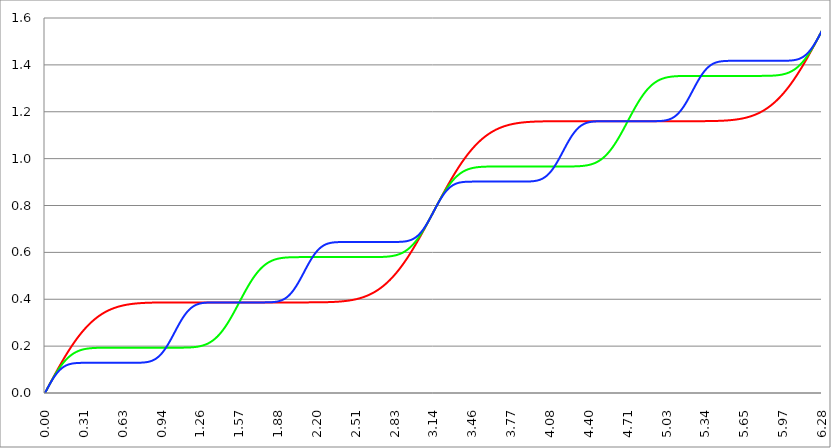
| Category | Series 1 | Series 0 | Series 2 |
|---|---|---|---|
| 0.0 | 0 | 0 | 0 |
| 0.00314159265358979 | 0.003 | 0.003 | 0.003 |
| 0.00628318530717958 | 0.006 | 0.006 | 0.006 |
| 0.00942477796076938 | 0.009 | 0.009 | 0.009 |
| 0.0125663706143592 | 0.013 | 0.013 | 0.013 |
| 0.015707963267949 | 0.016 | 0.016 | 0.016 |
| 0.0188495559215388 | 0.019 | 0.019 | 0.019 |
| 0.0219911485751285 | 0.022 | 0.022 | 0.022 |
| 0.0251327412287183 | 0.025 | 0.025 | 0.025 |
| 0.0282743338823081 | 0.028 | 0.028 | 0.028 |
| 0.0314159265358979 | 0.031 | 0.031 | 0.031 |
| 0.0345575191894877 | 0.034 | 0.034 | 0.034 |
| 0.0376991118430775 | 0.038 | 0.037 | 0.037 |
| 0.0408407044966673 | 0.041 | 0.04 | 0.04 |
| 0.0439822971502571 | 0.044 | 0.043 | 0.043 |
| 0.0471238898038469 | 0.047 | 0.046 | 0.046 |
| 0.0502654824574367 | 0.05 | 0.049 | 0.048 |
| 0.0534070751110265 | 0.053 | 0.052 | 0.051 |
| 0.0565486677646163 | 0.056 | 0.055 | 0.054 |
| 0.059690260418206 | 0.059 | 0.058 | 0.057 |
| 0.0628318530717958 | 0.062 | 0.061 | 0.059 |
| 0.0659734457253856 | 0.065 | 0.064 | 0.062 |
| 0.0691150383789754 | 0.069 | 0.067 | 0.064 |
| 0.0722566310325652 | 0.072 | 0.07 | 0.067 |
| 0.075398223686155 | 0.075 | 0.073 | 0.069 |
| 0.0785398163397448 | 0.078 | 0.075 | 0.072 |
| 0.0816814089933346 | 0.081 | 0.078 | 0.074 |
| 0.0848230016469244 | 0.084 | 0.081 | 0.076 |
| 0.0879645943005142 | 0.087 | 0.084 | 0.079 |
| 0.091106186954104 | 0.09 | 0.086 | 0.081 |
| 0.0942477796076937 | 0.093 | 0.089 | 0.083 |
| 0.0973893722612835 | 0.096 | 0.092 | 0.085 |
| 0.100530964914873 | 0.099 | 0.094 | 0.087 |
| 0.103672557568463 | 0.102 | 0.097 | 0.089 |
| 0.106814150222053 | 0.105 | 0.099 | 0.091 |
| 0.109955742875643 | 0.108 | 0.102 | 0.093 |
| 0.113097335529233 | 0.111 | 0.104 | 0.095 |
| 0.116238928182822 | 0.114 | 0.107 | 0.096 |
| 0.119380520836412 | 0.117 | 0.109 | 0.098 |
| 0.122522113490002 | 0.12 | 0.111 | 0.099 |
| 0.125663706143592 | 0.122 | 0.114 | 0.101 |
| 0.128805298797181 | 0.125 | 0.116 | 0.103 |
| 0.131946891450771 | 0.128 | 0.118 | 0.104 |
| 0.135088484104361 | 0.131 | 0.12 | 0.105 |
| 0.138230076757951 | 0.134 | 0.122 | 0.107 |
| 0.141371669411541 | 0.137 | 0.124 | 0.108 |
| 0.14451326206513 | 0.14 | 0.127 | 0.109 |
| 0.14765485471872 | 0.142 | 0.129 | 0.11 |
| 0.15079644737231 | 0.145 | 0.131 | 0.111 |
| 0.1539380400259 | 0.148 | 0.133 | 0.112 |
| 0.15707963267949 | 0.151 | 0.134 | 0.114 |
| 0.160221225333079 | 0.154 | 0.136 | 0.114 |
| 0.163362817986669 | 0.156 | 0.138 | 0.115 |
| 0.166504410640259 | 0.159 | 0.14 | 0.116 |
| 0.169646003293849 | 0.162 | 0.142 | 0.117 |
| 0.172787595947439 | 0.165 | 0.143 | 0.118 |
| 0.175929188601028 | 0.167 | 0.145 | 0.119 |
| 0.179070781254618 | 0.17 | 0.147 | 0.119 |
| 0.182212373908208 | 0.173 | 0.148 | 0.12 |
| 0.185353966561798 | 0.175 | 0.15 | 0.121 |
| 0.188495559215388 | 0.178 | 0.152 | 0.121 |
| 0.191637151868977 | 0.18 | 0.153 | 0.122 |
| 0.194778744522567 | 0.183 | 0.155 | 0.122 |
| 0.197920337176157 | 0.186 | 0.156 | 0.123 |
| 0.201061929829747 | 0.188 | 0.157 | 0.123 |
| 0.204203522483336 | 0.191 | 0.159 | 0.124 |
| 0.207345115136926 | 0.193 | 0.16 | 0.124 |
| 0.210486707790516 | 0.196 | 0.161 | 0.125 |
| 0.213628300444106 | 0.198 | 0.163 | 0.125 |
| 0.216769893097696 | 0.201 | 0.164 | 0.125 |
| 0.219911485751285 | 0.203 | 0.165 | 0.126 |
| 0.223053078404875 | 0.206 | 0.166 | 0.126 |
| 0.226194671058465 | 0.208 | 0.167 | 0.126 |
| 0.229336263712055 | 0.211 | 0.168 | 0.126 |
| 0.232477856365645 | 0.213 | 0.169 | 0.127 |
| 0.235619449019234 | 0.215 | 0.17 | 0.127 |
| 0.238761041672824 | 0.218 | 0.171 | 0.127 |
| 0.241902634326414 | 0.22 | 0.172 | 0.127 |
| 0.245044226980004 | 0.222 | 0.173 | 0.127 |
| 0.248185819633594 | 0.225 | 0.174 | 0.127 |
| 0.251327412287183 | 0.227 | 0.175 | 0.128 |
| 0.254469004940773 | 0.229 | 0.176 | 0.128 |
| 0.257610597594363 | 0.232 | 0.176 | 0.128 |
| 0.260752190247953 | 0.234 | 0.177 | 0.128 |
| 0.263893782901543 | 0.236 | 0.178 | 0.128 |
| 0.267035375555132 | 0.238 | 0.179 | 0.128 |
| 0.270176968208722 | 0.24 | 0.179 | 0.128 |
| 0.273318560862312 | 0.243 | 0.18 | 0.128 |
| 0.276460153515902 | 0.245 | 0.181 | 0.128 |
| 0.279601746169492 | 0.247 | 0.181 | 0.128 |
| 0.282743338823082 | 0.249 | 0.182 | 0.128 |
| 0.285884931476671 | 0.251 | 0.182 | 0.128 |
| 0.289026524130261 | 0.253 | 0.183 | 0.129 |
| 0.292168116783851 | 0.255 | 0.183 | 0.129 |
| 0.295309709437441 | 0.257 | 0.184 | 0.129 |
| 0.298451302091031 | 0.259 | 0.184 | 0.129 |
| 0.30159289474462 | 0.261 | 0.185 | 0.129 |
| 0.30473448739821 | 0.263 | 0.185 | 0.129 |
| 0.3078760800518 | 0.265 | 0.186 | 0.129 |
| 0.31101767270539 | 0.267 | 0.186 | 0.129 |
| 0.31415926535898 | 0.269 | 0.187 | 0.129 |
| 0.31730085801257 | 0.271 | 0.187 | 0.129 |
| 0.320442450666159 | 0.273 | 0.187 | 0.129 |
| 0.323584043319749 | 0.275 | 0.188 | 0.129 |
| 0.326725635973339 | 0.276 | 0.188 | 0.129 |
| 0.329867228626929 | 0.278 | 0.188 | 0.129 |
| 0.333008821280519 | 0.28 | 0.189 | 0.129 |
| 0.336150413934108 | 0.282 | 0.189 | 0.129 |
| 0.339292006587698 | 0.284 | 0.189 | 0.129 |
| 0.342433599241288 | 0.285 | 0.189 | 0.129 |
| 0.345575191894878 | 0.287 | 0.19 | 0.129 |
| 0.348716784548468 | 0.289 | 0.19 | 0.129 |
| 0.351858377202058 | 0.29 | 0.19 | 0.129 |
| 0.354999969855647 | 0.292 | 0.19 | 0.129 |
| 0.358141562509237 | 0.294 | 0.19 | 0.129 |
| 0.361283155162827 | 0.295 | 0.191 | 0.129 |
| 0.364424747816417 | 0.297 | 0.191 | 0.129 |
| 0.367566340470007 | 0.298 | 0.191 | 0.129 |
| 0.370707933123597 | 0.3 | 0.191 | 0.129 |
| 0.373849525777186 | 0.302 | 0.191 | 0.129 |
| 0.376991118430776 | 0.303 | 0.191 | 0.129 |
| 0.380132711084366 | 0.305 | 0.192 | 0.129 |
| 0.383274303737956 | 0.306 | 0.192 | 0.129 |
| 0.386415896391546 | 0.308 | 0.192 | 0.129 |
| 0.389557489045135 | 0.309 | 0.192 | 0.129 |
| 0.392699081698725 | 0.31 | 0.192 | 0.129 |
| 0.395840674352315 | 0.312 | 0.192 | 0.129 |
| 0.398982267005905 | 0.313 | 0.192 | 0.129 |
| 0.402123859659495 | 0.315 | 0.192 | 0.129 |
| 0.405265452313085 | 0.316 | 0.192 | 0.129 |
| 0.408407044966674 | 0.317 | 0.192 | 0.129 |
| 0.411548637620264 | 0.319 | 0.192 | 0.129 |
| 0.414690230273854 | 0.32 | 0.193 | 0.129 |
| 0.417831822927444 | 0.321 | 0.193 | 0.129 |
| 0.420973415581034 | 0.323 | 0.193 | 0.129 |
| 0.424115008234623 | 0.324 | 0.193 | 0.129 |
| 0.427256600888213 | 0.325 | 0.193 | 0.129 |
| 0.430398193541803 | 0.326 | 0.193 | 0.129 |
| 0.433539786195393 | 0.327 | 0.193 | 0.129 |
| 0.436681378848983 | 0.329 | 0.193 | 0.129 |
| 0.439822971502573 | 0.33 | 0.193 | 0.129 |
| 0.442964564156162 | 0.331 | 0.193 | 0.129 |
| 0.446106156809752 | 0.332 | 0.193 | 0.129 |
| 0.449247749463342 | 0.333 | 0.193 | 0.129 |
| 0.452389342116932 | 0.334 | 0.193 | 0.129 |
| 0.455530934770522 | 0.335 | 0.193 | 0.129 |
| 0.458672527424111 | 0.336 | 0.193 | 0.129 |
| 0.461814120077701 | 0.337 | 0.193 | 0.129 |
| 0.464955712731291 | 0.338 | 0.193 | 0.129 |
| 0.468097305384881 | 0.34 | 0.193 | 0.129 |
| 0.471238898038471 | 0.341 | 0.193 | 0.129 |
| 0.474380490692061 | 0.341 | 0.193 | 0.129 |
| 0.47752208334565 | 0.342 | 0.193 | 0.129 |
| 0.48066367599924 | 0.343 | 0.193 | 0.129 |
| 0.48380526865283 | 0.344 | 0.193 | 0.129 |
| 0.48694686130642 | 0.345 | 0.193 | 0.129 |
| 0.49008845396001 | 0.346 | 0.193 | 0.129 |
| 0.493230046613599 | 0.347 | 0.193 | 0.129 |
| 0.496371639267189 | 0.348 | 0.193 | 0.129 |
| 0.499513231920779 | 0.349 | 0.193 | 0.129 |
| 0.502654824574369 | 0.35 | 0.193 | 0.129 |
| 0.505796417227959 | 0.35 | 0.193 | 0.129 |
| 0.508938009881549 | 0.351 | 0.193 | 0.129 |
| 0.512079602535138 | 0.352 | 0.193 | 0.129 |
| 0.515221195188728 | 0.353 | 0.193 | 0.129 |
| 0.518362787842318 | 0.354 | 0.193 | 0.129 |
| 0.521504380495908 | 0.354 | 0.193 | 0.129 |
| 0.524645973149498 | 0.355 | 0.193 | 0.129 |
| 0.527787565803087 | 0.356 | 0.193 | 0.129 |
| 0.530929158456677 | 0.357 | 0.193 | 0.129 |
| 0.534070751110267 | 0.357 | 0.193 | 0.129 |
| 0.537212343763857 | 0.358 | 0.193 | 0.129 |
| 0.540353936417447 | 0.359 | 0.193 | 0.129 |
| 0.543495529071037 | 0.359 | 0.193 | 0.129 |
| 0.546637121724626 | 0.36 | 0.193 | 0.129 |
| 0.549778714378216 | 0.361 | 0.193 | 0.129 |
| 0.552920307031806 | 0.361 | 0.193 | 0.129 |
| 0.556061899685396 | 0.362 | 0.193 | 0.129 |
| 0.559203492338986 | 0.363 | 0.193 | 0.129 |
| 0.562345084992576 | 0.363 | 0.193 | 0.129 |
| 0.565486677646165 | 0.364 | 0.193 | 0.129 |
| 0.568628270299755 | 0.364 | 0.193 | 0.129 |
| 0.571769862953345 | 0.365 | 0.193 | 0.129 |
| 0.574911455606935 | 0.365 | 0.193 | 0.129 |
| 0.578053048260525 | 0.366 | 0.193 | 0.129 |
| 0.581194640914114 | 0.366 | 0.193 | 0.129 |
| 0.584336233567704 | 0.367 | 0.193 | 0.129 |
| 0.587477826221294 | 0.367 | 0.193 | 0.129 |
| 0.590619418874884 | 0.368 | 0.193 | 0.129 |
| 0.593761011528474 | 0.368 | 0.193 | 0.129 |
| 0.596902604182064 | 0.369 | 0.193 | 0.129 |
| 0.600044196835653 | 0.369 | 0.193 | 0.129 |
| 0.603185789489243 | 0.37 | 0.193 | 0.129 |
| 0.606327382142833 | 0.37 | 0.193 | 0.129 |
| 0.609468974796423 | 0.371 | 0.193 | 0.129 |
| 0.612610567450013 | 0.371 | 0.193 | 0.129 |
| 0.615752160103602 | 0.372 | 0.193 | 0.129 |
| 0.618893752757192 | 0.372 | 0.193 | 0.129 |
| 0.622035345410782 | 0.372 | 0.193 | 0.129 |
| 0.625176938064372 | 0.373 | 0.193 | 0.129 |
| 0.628318530717962 | 0.373 | 0.193 | 0.129 |
| 0.631460123371551 | 0.374 | 0.193 | 0.129 |
| 0.634601716025141 | 0.374 | 0.193 | 0.129 |
| 0.637743308678731 | 0.374 | 0.193 | 0.129 |
| 0.640884901332321 | 0.375 | 0.193 | 0.129 |
| 0.644026493985911 | 0.375 | 0.193 | 0.129 |
| 0.647168086639501 | 0.375 | 0.193 | 0.129 |
| 0.65030967929309 | 0.376 | 0.193 | 0.129 |
| 0.65345127194668 | 0.376 | 0.193 | 0.129 |
| 0.65659286460027 | 0.376 | 0.193 | 0.129 |
| 0.65973445725386 | 0.377 | 0.193 | 0.129 |
| 0.66287604990745 | 0.377 | 0.193 | 0.129 |
| 0.666017642561039 | 0.377 | 0.193 | 0.129 |
| 0.669159235214629 | 0.377 | 0.193 | 0.129 |
| 0.672300827868219 | 0.378 | 0.193 | 0.129 |
| 0.675442420521809 | 0.378 | 0.193 | 0.129 |
| 0.678584013175399 | 0.378 | 0.193 | 0.129 |
| 0.681725605828989 | 0.378 | 0.193 | 0.129 |
| 0.684867198482578 | 0.379 | 0.193 | 0.129 |
| 0.688008791136168 | 0.379 | 0.193 | 0.129 |
| 0.691150383789758 | 0.379 | 0.193 | 0.129 |
| 0.694291976443348 | 0.379 | 0.193 | 0.129 |
| 0.697433569096938 | 0.38 | 0.193 | 0.129 |
| 0.700575161750528 | 0.38 | 0.193 | 0.129 |
| 0.703716754404117 | 0.38 | 0.193 | 0.129 |
| 0.706858347057707 | 0.38 | 0.193 | 0.129 |
| 0.709999939711297 | 0.38 | 0.193 | 0.129 |
| 0.713141532364887 | 0.381 | 0.193 | 0.129 |
| 0.716283125018477 | 0.381 | 0.193 | 0.129 |
| 0.719424717672066 | 0.381 | 0.193 | 0.129 |
| 0.722566310325656 | 0.381 | 0.193 | 0.129 |
| 0.725707902979246 | 0.381 | 0.193 | 0.129 |
| 0.728849495632836 | 0.382 | 0.193 | 0.129 |
| 0.731991088286426 | 0.382 | 0.193 | 0.129 |
| 0.735132680940016 | 0.382 | 0.193 | 0.129 |
| 0.738274273593605 | 0.382 | 0.193 | 0.129 |
| 0.741415866247195 | 0.382 | 0.193 | 0.129 |
| 0.744557458900785 | 0.382 | 0.193 | 0.129 |
| 0.747699051554375 | 0.382 | 0.193 | 0.129 |
| 0.750840644207965 | 0.383 | 0.193 | 0.129 |
| 0.753982236861554 | 0.383 | 0.193 | 0.129 |
| 0.757123829515144 | 0.383 | 0.193 | 0.129 |
| 0.760265422168734 | 0.383 | 0.193 | 0.129 |
| 0.763407014822324 | 0.383 | 0.193 | 0.129 |
| 0.766548607475914 | 0.383 | 0.193 | 0.129 |
| 0.769690200129504 | 0.383 | 0.193 | 0.129 |
| 0.772831792783093 | 0.383 | 0.193 | 0.129 |
| 0.775973385436683 | 0.384 | 0.193 | 0.129 |
| 0.779114978090273 | 0.384 | 0.193 | 0.13 |
| 0.782256570743863 | 0.384 | 0.193 | 0.13 |
| 0.785398163397453 | 0.384 | 0.193 | 0.13 |
| 0.788539756051042 | 0.384 | 0.193 | 0.13 |
| 0.791681348704632 | 0.384 | 0.193 | 0.13 |
| 0.794822941358222 | 0.384 | 0.193 | 0.13 |
| 0.797964534011812 | 0.384 | 0.193 | 0.13 |
| 0.801106126665402 | 0.384 | 0.193 | 0.13 |
| 0.804247719318992 | 0.384 | 0.193 | 0.131 |
| 0.807389311972581 | 0.385 | 0.193 | 0.131 |
| 0.810530904626171 | 0.385 | 0.193 | 0.131 |
| 0.813672497279761 | 0.385 | 0.193 | 0.131 |
| 0.816814089933351 | 0.385 | 0.193 | 0.131 |
| 0.819955682586941 | 0.385 | 0.193 | 0.132 |
| 0.823097275240531 | 0.385 | 0.193 | 0.132 |
| 0.82623886789412 | 0.385 | 0.193 | 0.132 |
| 0.82938046054771 | 0.385 | 0.193 | 0.132 |
| 0.8325220532013 | 0.385 | 0.193 | 0.133 |
| 0.83566364585489 | 0.385 | 0.193 | 0.133 |
| 0.83880523850848 | 0.385 | 0.193 | 0.133 |
| 0.841946831162069 | 0.385 | 0.193 | 0.134 |
| 0.845088423815659 | 0.385 | 0.193 | 0.134 |
| 0.848230016469249 | 0.385 | 0.193 | 0.135 |
| 0.851371609122839 | 0.385 | 0.193 | 0.135 |
| 0.854513201776429 | 0.385 | 0.193 | 0.136 |
| 0.857654794430019 | 0.385 | 0.193 | 0.136 |
| 0.860796387083608 | 0.386 | 0.193 | 0.137 |
| 0.863937979737198 | 0.386 | 0.193 | 0.137 |
| 0.867079572390788 | 0.386 | 0.193 | 0.138 |
| 0.870221165044378 | 0.386 | 0.193 | 0.139 |
| 0.873362757697968 | 0.386 | 0.193 | 0.14 |
| 0.876504350351557 | 0.386 | 0.193 | 0.14 |
| 0.879645943005147 | 0.386 | 0.193 | 0.141 |
| 0.882787535658737 | 0.386 | 0.193 | 0.142 |
| 0.885929128312327 | 0.386 | 0.193 | 0.143 |
| 0.889070720965917 | 0.386 | 0.193 | 0.144 |
| 0.892212313619507 | 0.386 | 0.193 | 0.145 |
| 0.895353906273096 | 0.386 | 0.193 | 0.146 |
| 0.898495498926686 | 0.386 | 0.193 | 0.147 |
| 0.901637091580276 | 0.386 | 0.193 | 0.148 |
| 0.904778684233866 | 0.386 | 0.193 | 0.149 |
| 0.907920276887456 | 0.386 | 0.193 | 0.151 |
| 0.911061869541045 | 0.386 | 0.193 | 0.152 |
| 0.914203462194635 | 0.386 | 0.193 | 0.153 |
| 0.917345054848225 | 0.386 | 0.193 | 0.155 |
| 0.920486647501815 | 0.386 | 0.193 | 0.156 |
| 0.923628240155405 | 0.386 | 0.193 | 0.158 |
| 0.926769832808995 | 0.386 | 0.193 | 0.159 |
| 0.929911425462584 | 0.386 | 0.193 | 0.161 |
| 0.933053018116174 | 0.386 | 0.193 | 0.163 |
| 0.936194610769764 | 0.386 | 0.193 | 0.164 |
| 0.939336203423354 | 0.386 | 0.193 | 0.166 |
| 0.942477796076944 | 0.386 | 0.193 | 0.168 |
| 0.945619388730533 | 0.386 | 0.193 | 0.17 |
| 0.948760981384123 | 0.386 | 0.193 | 0.172 |
| 0.951902574037713 | 0.386 | 0.193 | 0.174 |
| 0.955044166691303 | 0.386 | 0.193 | 0.176 |
| 0.958185759344893 | 0.386 | 0.193 | 0.178 |
| 0.961327351998483 | 0.386 | 0.193 | 0.181 |
| 0.964468944652072 | 0.386 | 0.193 | 0.183 |
| 0.967610537305662 | 0.386 | 0.193 | 0.185 |
| 0.970752129959252 | 0.386 | 0.193 | 0.187 |
| 0.973893722612842 | 0.386 | 0.193 | 0.19 |
| 0.977035315266432 | 0.386 | 0.193 | 0.192 |
| 0.980176907920022 | 0.386 | 0.193 | 0.195 |
| 0.983318500573611 | 0.386 | 0.193 | 0.198 |
| 0.986460093227201 | 0.386 | 0.193 | 0.2 |
| 0.989601685880791 | 0.386 | 0.193 | 0.203 |
| 0.992743278534381 | 0.386 | 0.193 | 0.206 |
| 0.995884871187971 | 0.386 | 0.193 | 0.208 |
| 0.99902646384156 | 0.386 | 0.193 | 0.211 |
| 1.00216805649515 | 0.386 | 0.193 | 0.214 |
| 1.00530964914874 | 0.386 | 0.193 | 0.217 |
| 1.00845124180233 | 0.386 | 0.193 | 0.22 |
| 1.01159283445592 | 0.386 | 0.193 | 0.223 |
| 1.01473442710951 | 0.386 | 0.193 | 0.226 |
| 1.017876019763099 | 0.386 | 0.193 | 0.229 |
| 1.021017612416689 | 0.386 | 0.193 | 0.232 |
| 1.02415920507028 | 0.386 | 0.193 | 0.235 |
| 1.027300797723869 | 0.386 | 0.193 | 0.238 |
| 1.030442390377459 | 0.386 | 0.193 | 0.241 |
| 1.033583983031048 | 0.386 | 0.193 | 0.244 |
| 1.036725575684638 | 0.387 | 0.193 | 0.247 |
| 1.039867168338228 | 0.387 | 0.193 | 0.25 |
| 1.043008760991818 | 0.387 | 0.193 | 0.254 |
| 1.046150353645408 | 0.387 | 0.193 | 0.257 |
| 1.049291946298998 | 0.387 | 0.193 | 0.26 |
| 1.052433538952587 | 0.387 | 0.193 | 0.263 |
| 1.055575131606177 | 0.387 | 0.193 | 0.266 |
| 1.058716724259767 | 0.387 | 0.193 | 0.269 |
| 1.061858316913357 | 0.387 | 0.193 | 0.272 |
| 1.064999909566947 | 0.387 | 0.193 | 0.275 |
| 1.068141502220536 | 0.387 | 0.193 | 0.279 |
| 1.071283094874126 | 0.387 | 0.193 | 0.282 |
| 1.074424687527716 | 0.387 | 0.193 | 0.285 |
| 1.077566280181306 | 0.387 | 0.193 | 0.288 |
| 1.080707872834896 | 0.387 | 0.193 | 0.291 |
| 1.083849465488486 | 0.387 | 0.193 | 0.294 |
| 1.086991058142075 | 0.387 | 0.193 | 0.297 |
| 1.090132650795665 | 0.387 | 0.193 | 0.299 |
| 1.093274243449255 | 0.387 | 0.193 | 0.302 |
| 1.096415836102845 | 0.387 | 0.193 | 0.305 |
| 1.099557428756435 | 0.387 | 0.193 | 0.308 |
| 1.102699021410025 | 0.387 | 0.193 | 0.311 |
| 1.105840614063614 | 0.387 | 0.193 | 0.313 |
| 1.108982206717204 | 0.387 | 0.193 | 0.316 |
| 1.112123799370794 | 0.387 | 0.194 | 0.319 |
| 1.115265392024384 | 0.387 | 0.194 | 0.321 |
| 1.118406984677974 | 0.387 | 0.194 | 0.324 |
| 1.121548577331563 | 0.387 | 0.194 | 0.326 |
| 1.124690169985153 | 0.387 | 0.194 | 0.329 |
| 1.127831762638743 | 0.387 | 0.194 | 0.331 |
| 1.130973355292333 | 0.387 | 0.194 | 0.333 |
| 1.134114947945923 | 0.387 | 0.194 | 0.336 |
| 1.137256540599513 | 0.387 | 0.194 | 0.338 |
| 1.140398133253102 | 0.387 | 0.194 | 0.34 |
| 1.143539725906692 | 0.387 | 0.194 | 0.342 |
| 1.146681318560282 | 0.387 | 0.194 | 0.344 |
| 1.149822911213872 | 0.387 | 0.194 | 0.346 |
| 1.152964503867462 | 0.387 | 0.194 | 0.348 |
| 1.156106096521051 | 0.387 | 0.194 | 0.35 |
| 1.159247689174641 | 0.387 | 0.194 | 0.352 |
| 1.162389281828231 | 0.387 | 0.194 | 0.353 |
| 1.165530874481821 | 0.387 | 0.194 | 0.355 |
| 1.168672467135411 | 0.387 | 0.194 | 0.357 |
| 1.171814059789001 | 0.387 | 0.194 | 0.358 |
| 1.17495565244259 | 0.387 | 0.195 | 0.36 |
| 1.17809724509618 | 0.387 | 0.195 | 0.361 |
| 1.18123883774977 | 0.387 | 0.195 | 0.363 |
| 1.18438043040336 | 0.387 | 0.195 | 0.364 |
| 1.18752202305695 | 0.387 | 0.195 | 0.365 |
| 1.190663615710539 | 0.387 | 0.195 | 0.366 |
| 1.193805208364129 | 0.387 | 0.195 | 0.368 |
| 1.19694680101772 | 0.387 | 0.195 | 0.369 |
| 1.200088393671309 | 0.387 | 0.195 | 0.37 |
| 1.203229986324899 | 0.387 | 0.196 | 0.371 |
| 1.206371578978489 | 0.387 | 0.196 | 0.372 |
| 1.209513171632078 | 0.387 | 0.196 | 0.373 |
| 1.212654764285668 | 0.387 | 0.196 | 0.374 |
| 1.215796356939258 | 0.387 | 0.196 | 0.375 |
| 1.218937949592848 | 0.387 | 0.197 | 0.375 |
| 1.222079542246438 | 0.387 | 0.197 | 0.376 |
| 1.225221134900027 | 0.387 | 0.197 | 0.377 |
| 1.228362727553617 | 0.387 | 0.197 | 0.378 |
| 1.231504320207207 | 0.387 | 0.197 | 0.378 |
| 1.234645912860797 | 0.387 | 0.198 | 0.379 |
| 1.237787505514387 | 0.387 | 0.198 | 0.379 |
| 1.240929098167977 | 0.387 | 0.198 | 0.38 |
| 1.244070690821566 | 0.387 | 0.199 | 0.38 |
| 1.247212283475156 | 0.387 | 0.199 | 0.381 |
| 1.250353876128746 | 0.387 | 0.199 | 0.381 |
| 1.253495468782336 | 0.387 | 0.2 | 0.382 |
| 1.256637061435926 | 0.387 | 0.2 | 0.382 |
| 1.259778654089515 | 0.387 | 0.2 | 0.382 |
| 1.262920246743105 | 0.387 | 0.201 | 0.383 |
| 1.266061839396695 | 0.387 | 0.201 | 0.383 |
| 1.269203432050285 | 0.387 | 0.202 | 0.383 |
| 1.272345024703875 | 0.387 | 0.202 | 0.384 |
| 1.275486617357465 | 0.387 | 0.203 | 0.384 |
| 1.278628210011054 | 0.387 | 0.203 | 0.384 |
| 1.281769802664644 | 0.387 | 0.204 | 0.384 |
| 1.284911395318234 | 0.387 | 0.204 | 0.385 |
| 1.288052987971824 | 0.387 | 0.205 | 0.385 |
| 1.291194580625414 | 0.387 | 0.205 | 0.385 |
| 1.294336173279003 | 0.387 | 0.206 | 0.385 |
| 1.297477765932593 | 0.387 | 0.207 | 0.385 |
| 1.300619358586183 | 0.387 | 0.207 | 0.385 |
| 1.303760951239773 | 0.387 | 0.208 | 0.386 |
| 1.306902543893363 | 0.387 | 0.209 | 0.386 |
| 1.310044136546953 | 0.387 | 0.209 | 0.386 |
| 1.313185729200542 | 0.387 | 0.21 | 0.386 |
| 1.316327321854132 | 0.387 | 0.211 | 0.386 |
| 1.319468914507722 | 0.387 | 0.212 | 0.386 |
| 1.322610507161312 | 0.387 | 0.213 | 0.386 |
| 1.325752099814902 | 0.387 | 0.213 | 0.386 |
| 1.328893692468491 | 0.387 | 0.214 | 0.386 |
| 1.332035285122081 | 0.387 | 0.215 | 0.386 |
| 1.335176877775671 | 0.387 | 0.216 | 0.386 |
| 1.338318470429261 | 0.387 | 0.217 | 0.386 |
| 1.341460063082851 | 0.387 | 0.218 | 0.386 |
| 1.344601655736441 | 0.387 | 0.219 | 0.386 |
| 1.34774324839003 | 0.387 | 0.221 | 0.386 |
| 1.35088484104362 | 0.387 | 0.222 | 0.386 |
| 1.35402643369721 | 0.387 | 0.223 | 0.386 |
| 1.3571680263508 | 0.387 | 0.224 | 0.386 |
| 1.36030961900439 | 0.387 | 0.225 | 0.386 |
| 1.363451211657979 | 0.387 | 0.227 | 0.386 |
| 1.36659280431157 | 0.387 | 0.228 | 0.386 |
| 1.369734396965159 | 0.387 | 0.229 | 0.386 |
| 1.372875989618749 | 0.387 | 0.231 | 0.387 |
| 1.376017582272339 | 0.387 | 0.232 | 0.387 |
| 1.379159174925929 | 0.387 | 0.234 | 0.387 |
| 1.382300767579518 | 0.387 | 0.235 | 0.387 |
| 1.385442360233108 | 0.387 | 0.237 | 0.387 |
| 1.388583952886698 | 0.387 | 0.238 | 0.387 |
| 1.391725545540288 | 0.387 | 0.24 | 0.387 |
| 1.394867138193878 | 0.387 | 0.241 | 0.387 |
| 1.398008730847468 | 0.387 | 0.243 | 0.387 |
| 1.401150323501057 | 0.387 | 0.245 | 0.387 |
| 1.404291916154647 | 0.387 | 0.247 | 0.387 |
| 1.407433508808237 | 0.387 | 0.248 | 0.387 |
| 1.410575101461827 | 0.387 | 0.25 | 0.387 |
| 1.413716694115417 | 0.387 | 0.252 | 0.387 |
| 1.416858286769006 | 0.387 | 0.254 | 0.387 |
| 1.419999879422596 | 0.387 | 0.256 | 0.387 |
| 1.423141472076186 | 0.387 | 0.258 | 0.387 |
| 1.426283064729776 | 0.387 | 0.26 | 0.387 |
| 1.429424657383366 | 0.387 | 0.262 | 0.387 |
| 1.432566250036956 | 0.387 | 0.264 | 0.387 |
| 1.435707842690545 | 0.387 | 0.266 | 0.387 |
| 1.438849435344135 | 0.387 | 0.269 | 0.387 |
| 1.441991027997725 | 0.387 | 0.271 | 0.387 |
| 1.445132620651315 | 0.387 | 0.273 | 0.387 |
| 1.448274213304905 | 0.387 | 0.275 | 0.387 |
| 1.451415805958494 | 0.387 | 0.278 | 0.387 |
| 1.454557398612084 | 0.387 | 0.28 | 0.387 |
| 1.457698991265674 | 0.387 | 0.282 | 0.387 |
| 1.460840583919264 | 0.387 | 0.285 | 0.387 |
| 1.463982176572854 | 0.387 | 0.287 | 0.387 |
| 1.467123769226444 | 0.387 | 0.29 | 0.387 |
| 1.470265361880033 | 0.387 | 0.292 | 0.387 |
| 1.473406954533623 | 0.387 | 0.295 | 0.387 |
| 1.476548547187213 | 0.387 | 0.298 | 0.387 |
| 1.479690139840803 | 0.387 | 0.3 | 0.387 |
| 1.482831732494393 | 0.387 | 0.303 | 0.387 |
| 1.485973325147982 | 0.387 | 0.306 | 0.387 |
| 1.489114917801572 | 0.387 | 0.308 | 0.387 |
| 1.492256510455162 | 0.387 | 0.311 | 0.387 |
| 1.495398103108752 | 0.387 | 0.314 | 0.387 |
| 1.498539695762342 | 0.387 | 0.317 | 0.387 |
| 1.501681288415932 | 0.387 | 0.32 | 0.387 |
| 1.504822881069521 | 0.387 | 0.322 | 0.387 |
| 1.507964473723111 | 0.387 | 0.325 | 0.387 |
| 1.511106066376701 | 0.387 | 0.328 | 0.387 |
| 1.514247659030291 | 0.387 | 0.331 | 0.387 |
| 1.517389251683881 | 0.387 | 0.334 | 0.387 |
| 1.520530844337471 | 0.387 | 0.337 | 0.387 |
| 1.52367243699106 | 0.387 | 0.34 | 0.387 |
| 1.52681402964465 | 0.387 | 0.343 | 0.387 |
| 1.52995562229824 | 0.387 | 0.346 | 0.387 |
| 1.53309721495183 | 0.387 | 0.349 | 0.387 |
| 1.53623880760542 | 0.387 | 0.352 | 0.387 |
| 1.539380400259009 | 0.387 | 0.355 | 0.387 |
| 1.542521992912599 | 0.387 | 0.358 | 0.387 |
| 1.545663585566189 | 0.387 | 0.362 | 0.387 |
| 1.548805178219779 | 0.387 | 0.365 | 0.387 |
| 1.551946770873369 | 0.387 | 0.368 | 0.387 |
| 1.555088363526959 | 0.387 | 0.371 | 0.387 |
| 1.558229956180548 | 0.387 | 0.374 | 0.387 |
| 1.561371548834138 | 0.387 | 0.377 | 0.387 |
| 1.564513141487728 | 0.387 | 0.38 | 0.387 |
| 1.567654734141318 | 0.387 | 0.383 | 0.387 |
| 1.570796326794908 | 0.387 | 0.387 | 0.387 |
| 1.573937919448497 | 0.387 | 0.39 | 0.387 |
| 1.577079512102087 | 0.387 | 0.393 | 0.387 |
| 1.580221104755677 | 0.387 | 0.396 | 0.387 |
| 1.583362697409267 | 0.387 | 0.399 | 0.387 |
| 1.586504290062857 | 0.387 | 0.402 | 0.387 |
| 1.589645882716447 | 0.387 | 0.405 | 0.387 |
| 1.592787475370036 | 0.387 | 0.408 | 0.387 |
| 1.595929068023626 | 0.387 | 0.412 | 0.387 |
| 1.599070660677216 | 0.387 | 0.415 | 0.387 |
| 1.602212253330806 | 0.387 | 0.418 | 0.387 |
| 1.605353845984396 | 0.387 | 0.421 | 0.387 |
| 1.608495438637985 | 0.387 | 0.424 | 0.387 |
| 1.611637031291575 | 0.387 | 0.427 | 0.387 |
| 1.614778623945165 | 0.387 | 0.43 | 0.387 |
| 1.617920216598755 | 0.387 | 0.433 | 0.387 |
| 1.621061809252345 | 0.387 | 0.436 | 0.387 |
| 1.624203401905935 | 0.387 | 0.439 | 0.387 |
| 1.627344994559524 | 0.387 | 0.442 | 0.387 |
| 1.630486587213114 | 0.387 | 0.445 | 0.387 |
| 1.633628179866704 | 0.387 | 0.448 | 0.387 |
| 1.636769772520294 | 0.387 | 0.451 | 0.387 |
| 1.639911365173884 | 0.387 | 0.454 | 0.387 |
| 1.643052957827473 | 0.387 | 0.456 | 0.387 |
| 1.646194550481063 | 0.387 | 0.459 | 0.387 |
| 1.649336143134653 | 0.387 | 0.462 | 0.387 |
| 1.652477735788243 | 0.387 | 0.465 | 0.387 |
| 1.655619328441833 | 0.387 | 0.467 | 0.387 |
| 1.658760921095423 | 0.387 | 0.47 | 0.387 |
| 1.661902513749012 | 0.387 | 0.473 | 0.387 |
| 1.665044106402602 | 0.387 | 0.475 | 0.387 |
| 1.668185699056192 | 0.387 | 0.478 | 0.387 |
| 1.671327291709782 | 0.387 | 0.481 | 0.387 |
| 1.674468884363372 | 0.387 | 0.483 | 0.387 |
| 1.677610477016961 | 0.387 | 0.486 | 0.387 |
| 1.680752069670551 | 0.387 | 0.488 | 0.387 |
| 1.683893662324141 | 0.387 | 0.491 | 0.387 |
| 1.687035254977731 | 0.387 | 0.493 | 0.387 |
| 1.690176847631321 | 0.387 | 0.495 | 0.387 |
| 1.693318440284911 | 0.387 | 0.498 | 0.387 |
| 1.6964600329385 | 0.387 | 0.5 | 0.387 |
| 1.69960162559209 | 0.387 | 0.502 | 0.387 |
| 1.70274321824568 | 0.387 | 0.505 | 0.387 |
| 1.70588481089927 | 0.387 | 0.507 | 0.387 |
| 1.70902640355286 | 0.387 | 0.509 | 0.387 |
| 1.712167996206449 | 0.387 | 0.511 | 0.387 |
| 1.715309588860039 | 0.387 | 0.513 | 0.387 |
| 1.71845118151363 | 0.387 | 0.515 | 0.387 |
| 1.721592774167219 | 0.387 | 0.517 | 0.387 |
| 1.724734366820809 | 0.387 | 0.519 | 0.387 |
| 1.727875959474399 | 0.387 | 0.521 | 0.387 |
| 1.731017552127988 | 0.387 | 0.523 | 0.387 |
| 1.734159144781578 | 0.387 | 0.525 | 0.387 |
| 1.737300737435168 | 0.387 | 0.527 | 0.387 |
| 1.740442330088758 | 0.387 | 0.528 | 0.387 |
| 1.743583922742348 | 0.387 | 0.53 | 0.387 |
| 1.746725515395937 | 0.387 | 0.532 | 0.387 |
| 1.749867108049527 | 0.387 | 0.533 | 0.387 |
| 1.753008700703117 | 0.387 | 0.535 | 0.387 |
| 1.756150293356707 | 0.387 | 0.537 | 0.387 |
| 1.759291886010297 | 0.387 | 0.538 | 0.387 |
| 1.762433478663887 | 0.387 | 0.54 | 0.387 |
| 1.765575071317476 | 0.387 | 0.541 | 0.387 |
| 1.768716663971066 | 0.387 | 0.543 | 0.387 |
| 1.771858256624656 | 0.387 | 0.544 | 0.387 |
| 1.774999849278246 | 0.387 | 0.545 | 0.387 |
| 1.778141441931836 | 0.387 | 0.547 | 0.387 |
| 1.781283034585426 | 0.387 | 0.548 | 0.387 |
| 1.784424627239015 | 0.387 | 0.549 | 0.387 |
| 1.787566219892605 | 0.387 | 0.55 | 0.387 |
| 1.790707812546195 | 0.387 | 0.551 | 0.387 |
| 1.793849405199785 | 0.387 | 0.553 | 0.387 |
| 1.796990997853375 | 0.387 | 0.554 | 0.387 |
| 1.800132590506964 | 0.387 | 0.555 | 0.387 |
| 1.803274183160554 | 0.387 | 0.556 | 0.387 |
| 1.806415775814144 | 0.387 | 0.557 | 0.387 |
| 1.809557368467734 | 0.387 | 0.558 | 0.387 |
| 1.812698961121324 | 0.387 | 0.559 | 0.387 |
| 1.815840553774914 | 0.387 | 0.56 | 0.387 |
| 1.818982146428503 | 0.387 | 0.561 | 0.387 |
| 1.822123739082093 | 0.387 | 0.561 | 0.387 |
| 1.825265331735683 | 0.387 | 0.562 | 0.387 |
| 1.828406924389273 | 0.387 | 0.563 | 0.387 |
| 1.831548517042863 | 0.387 | 0.564 | 0.387 |
| 1.834690109696452 | 0.387 | 0.565 | 0.388 |
| 1.837831702350042 | 0.387 | 0.565 | 0.388 |
| 1.840973295003632 | 0.387 | 0.566 | 0.388 |
| 1.844114887657222 | 0.387 | 0.567 | 0.388 |
| 1.847256480310812 | 0.387 | 0.567 | 0.388 |
| 1.850398072964402 | 0.387 | 0.568 | 0.388 |
| 1.853539665617991 | 0.387 | 0.568 | 0.388 |
| 1.856681258271581 | 0.387 | 0.569 | 0.389 |
| 1.859822850925171 | 0.387 | 0.57 | 0.389 |
| 1.862964443578761 | 0.387 | 0.57 | 0.389 |
| 1.866106036232351 | 0.387 | 0.571 | 0.389 |
| 1.86924762888594 | 0.387 | 0.571 | 0.389 |
| 1.87238922153953 | 0.387 | 0.571 | 0.39 |
| 1.87553081419312 | 0.387 | 0.572 | 0.39 |
| 1.87867240684671 | 0.387 | 0.572 | 0.39 |
| 1.8818139995003 | 0.387 | 0.573 | 0.391 |
| 1.88495559215389 | 0.387 | 0.573 | 0.391 |
| 1.888097184807479 | 0.387 | 0.574 | 0.391 |
| 1.891238777461069 | 0.387 | 0.574 | 0.392 |
| 1.89438037011466 | 0.387 | 0.574 | 0.392 |
| 1.897521962768249 | 0.387 | 0.575 | 0.393 |
| 1.900663555421839 | 0.387 | 0.575 | 0.393 |
| 1.903805148075429 | 0.387 | 0.575 | 0.394 |
| 1.906946740729018 | 0.387 | 0.575 | 0.394 |
| 1.910088333382608 | 0.387 | 0.576 | 0.395 |
| 1.913229926036198 | 0.387 | 0.576 | 0.396 |
| 1.916371518689788 | 0.387 | 0.576 | 0.396 |
| 1.919513111343378 | 0.387 | 0.576 | 0.397 |
| 1.922654703996967 | 0.387 | 0.577 | 0.398 |
| 1.925796296650557 | 0.387 | 0.577 | 0.399 |
| 1.928937889304147 | 0.387 | 0.577 | 0.399 |
| 1.932079481957737 | 0.387 | 0.577 | 0.4 |
| 1.935221074611327 | 0.387 | 0.577 | 0.401 |
| 1.938362667264917 | 0.387 | 0.578 | 0.402 |
| 1.941504259918506 | 0.387 | 0.578 | 0.403 |
| 1.944645852572096 | 0.387 | 0.578 | 0.404 |
| 1.947787445225686 | 0.387 | 0.578 | 0.405 |
| 1.950929037879276 | 0.387 | 0.578 | 0.407 |
| 1.954070630532866 | 0.387 | 0.578 | 0.408 |
| 1.957212223186455 | 0.387 | 0.578 | 0.409 |
| 1.960353815840045 | 0.387 | 0.578 | 0.411 |
| 1.963495408493635 | 0.387 | 0.579 | 0.412 |
| 1.966637001147225 | 0.387 | 0.579 | 0.413 |
| 1.969778593800815 | 0.387 | 0.579 | 0.415 |
| 1.972920186454405 | 0.387 | 0.579 | 0.416 |
| 1.976061779107994 | 0.387 | 0.579 | 0.418 |
| 1.979203371761584 | 0.387 | 0.579 | 0.42 |
| 1.982344964415174 | 0.387 | 0.579 | 0.421 |
| 1.985486557068764 | 0.387 | 0.579 | 0.423 |
| 1.988628149722354 | 0.387 | 0.579 | 0.425 |
| 1.991769742375943 | 0.387 | 0.579 | 0.427 |
| 1.994911335029533 | 0.387 | 0.579 | 0.429 |
| 1.998052927683123 | 0.387 | 0.579 | 0.431 |
| 2.001194520336712 | 0.387 | 0.579 | 0.433 |
| 2.004336112990302 | 0.387 | 0.579 | 0.435 |
| 2.007477705643892 | 0.387 | 0.579 | 0.437 |
| 2.010619298297482 | 0.387 | 0.579 | 0.44 |
| 2.013760890951071 | 0.387 | 0.579 | 0.442 |
| 2.016902483604661 | 0.387 | 0.58 | 0.444 |
| 2.02004407625825 | 0.387 | 0.58 | 0.447 |
| 2.02318566891184 | 0.387 | 0.58 | 0.449 |
| 2.02632726156543 | 0.387 | 0.58 | 0.452 |
| 2.029468854219019 | 0.387 | 0.58 | 0.454 |
| 2.032610446872609 | 0.387 | 0.58 | 0.457 |
| 2.035752039526198 | 0.387 | 0.58 | 0.46 |
| 2.038893632179788 | 0.387 | 0.58 | 0.462 |
| 2.042035224833378 | 0.387 | 0.58 | 0.465 |
| 2.045176817486967 | 0.387 | 0.58 | 0.468 |
| 2.048318410140557 | 0.387 | 0.58 | 0.471 |
| 2.051460002794146 | 0.387 | 0.58 | 0.474 |
| 2.054601595447736 | 0.387 | 0.58 | 0.477 |
| 2.057743188101325 | 0.387 | 0.58 | 0.479 |
| 2.060884780754915 | 0.387 | 0.58 | 0.482 |
| 2.064026373408505 | 0.387 | 0.58 | 0.485 |
| 2.067167966062094 | 0.387 | 0.58 | 0.488 |
| 2.070309558715684 | 0.387 | 0.58 | 0.492 |
| 2.073451151369273 | 0.387 | 0.58 | 0.495 |
| 2.076592744022863 | 0.387 | 0.58 | 0.498 |
| 2.079734336676452 | 0.387 | 0.58 | 0.501 |
| 2.082875929330042 | 0.387 | 0.58 | 0.504 |
| 2.086017521983632 | 0.387 | 0.58 | 0.507 |
| 2.089159114637221 | 0.387 | 0.58 | 0.51 |
| 2.092300707290811 | 0.387 | 0.58 | 0.513 |
| 2.095442299944401 | 0.387 | 0.58 | 0.516 |
| 2.09858389259799 | 0.387 | 0.58 | 0.52 |
| 2.10172548525158 | 0.387 | 0.58 | 0.523 |
| 2.104867077905169 | 0.387 | 0.58 | 0.526 |
| 2.108008670558759 | 0.387 | 0.58 | 0.529 |
| 2.111150263212349 | 0.387 | 0.58 | 0.532 |
| 2.114291855865938 | 0.387 | 0.58 | 0.535 |
| 2.117433448519528 | 0.387 | 0.58 | 0.538 |
| 2.120575041173117 | 0.387 | 0.58 | 0.541 |
| 2.123716633826707 | 0.387 | 0.58 | 0.544 |
| 2.126858226480297 | 0.387 | 0.58 | 0.547 |
| 2.129999819133886 | 0.387 | 0.58 | 0.55 |
| 2.133141411787476 | 0.387 | 0.58 | 0.553 |
| 2.136283004441065 | 0.387 | 0.58 | 0.556 |
| 2.139424597094655 | 0.387 | 0.58 | 0.559 |
| 2.142566189748245 | 0.387 | 0.58 | 0.562 |
| 2.145707782401834 | 0.387 | 0.58 | 0.565 |
| 2.148849375055424 | 0.387 | 0.58 | 0.568 |
| 2.151990967709013 | 0.387 | 0.58 | 0.57 |
| 2.155132560362603 | 0.387 | 0.58 | 0.573 |
| 2.158274153016193 | 0.387 | 0.58 | 0.576 |
| 2.161415745669782 | 0.387 | 0.58 | 0.578 |
| 2.164557338323372 | 0.387 | 0.58 | 0.581 |
| 2.167698930976961 | 0.387 | 0.58 | 0.583 |
| 2.170840523630551 | 0.387 | 0.58 | 0.586 |
| 2.173982116284141 | 0.387 | 0.58 | 0.588 |
| 2.17712370893773 | 0.387 | 0.58 | 0.59 |
| 2.18026530159132 | 0.387 | 0.58 | 0.593 |
| 2.183406894244909 | 0.387 | 0.58 | 0.595 |
| 2.186548486898499 | 0.387 | 0.58 | 0.597 |
| 2.189690079552089 | 0.387 | 0.58 | 0.599 |
| 2.192831672205678 | 0.387 | 0.58 | 0.601 |
| 2.195973264859268 | 0.387 | 0.58 | 0.603 |
| 2.199114857512857 | 0.387 | 0.58 | 0.605 |
| 2.202256450166447 | 0.387 | 0.58 | 0.607 |
| 2.205398042820036 | 0.387 | 0.58 | 0.609 |
| 2.208539635473626 | 0.387 | 0.58 | 0.611 |
| 2.211681228127216 | 0.387 | 0.58 | 0.612 |
| 2.214822820780805 | 0.387 | 0.58 | 0.614 |
| 2.217964413434395 | 0.387 | 0.58 | 0.615 |
| 2.221106006087984 | 0.387 | 0.58 | 0.617 |
| 2.224247598741574 | 0.387 | 0.58 | 0.618 |
| 2.227389191395164 | 0.387 | 0.58 | 0.62 |
| 2.230530784048753 | 0.387 | 0.58 | 0.621 |
| 2.233672376702343 | 0.387 | 0.58 | 0.623 |
| 2.236813969355933 | 0.387 | 0.58 | 0.624 |
| 2.239955562009522 | 0.387 | 0.58 | 0.625 |
| 2.243097154663112 | 0.387 | 0.58 | 0.626 |
| 2.246238747316701 | 0.387 | 0.58 | 0.627 |
| 2.249380339970291 | 0.387 | 0.58 | 0.628 |
| 2.252521932623881 | 0.387 | 0.58 | 0.629 |
| 2.25566352527747 | 0.387 | 0.58 | 0.63 |
| 2.25880511793106 | 0.387 | 0.58 | 0.631 |
| 2.261946710584649 | 0.387 | 0.58 | 0.632 |
| 2.265088303238239 | 0.387 | 0.58 | 0.633 |
| 2.268229895891829 | 0.387 | 0.58 | 0.634 |
| 2.271371488545418 | 0.387 | 0.58 | 0.634 |
| 2.274513081199008 | 0.388 | 0.58 | 0.635 |
| 2.277654673852597 | 0.388 | 0.58 | 0.636 |
| 2.280796266506186 | 0.388 | 0.58 | 0.636 |
| 2.283937859159776 | 0.388 | 0.58 | 0.637 |
| 2.287079451813366 | 0.388 | 0.58 | 0.637 |
| 2.290221044466955 | 0.388 | 0.58 | 0.638 |
| 2.293362637120545 | 0.388 | 0.58 | 0.638 |
| 2.296504229774135 | 0.388 | 0.58 | 0.639 |
| 2.299645822427724 | 0.388 | 0.58 | 0.639 |
| 2.302787415081314 | 0.388 | 0.58 | 0.64 |
| 2.305929007734904 | 0.388 | 0.58 | 0.64 |
| 2.309070600388493 | 0.388 | 0.58 | 0.64 |
| 2.312212193042083 | 0.388 | 0.58 | 0.641 |
| 2.315353785695672 | 0.388 | 0.58 | 0.641 |
| 2.318495378349262 | 0.388 | 0.58 | 0.641 |
| 2.321636971002852 | 0.388 | 0.58 | 0.642 |
| 2.324778563656441 | 0.388 | 0.58 | 0.642 |
| 2.327920156310031 | 0.388 | 0.58 | 0.642 |
| 2.33106174896362 | 0.389 | 0.58 | 0.642 |
| 2.33420334161721 | 0.389 | 0.58 | 0.642 |
| 2.3373449342708 | 0.389 | 0.58 | 0.643 |
| 2.340486526924389 | 0.389 | 0.58 | 0.643 |
| 2.343628119577979 | 0.389 | 0.58 | 0.643 |
| 2.346769712231568 | 0.389 | 0.58 | 0.643 |
| 2.349911304885158 | 0.389 | 0.58 | 0.643 |
| 2.353052897538748 | 0.389 | 0.58 | 0.643 |
| 2.356194490192337 | 0.389 | 0.58 | 0.643 |
| 2.359336082845927 | 0.389 | 0.58 | 0.643 |
| 2.362477675499516 | 0.389 | 0.58 | 0.644 |
| 2.365619268153106 | 0.39 | 0.58 | 0.644 |
| 2.368760860806696 | 0.39 | 0.58 | 0.644 |
| 2.371902453460285 | 0.39 | 0.58 | 0.644 |
| 2.375044046113875 | 0.39 | 0.58 | 0.644 |
| 2.378185638767464 | 0.39 | 0.58 | 0.644 |
| 2.381327231421054 | 0.39 | 0.58 | 0.644 |
| 2.384468824074644 | 0.39 | 0.58 | 0.644 |
| 2.387610416728233 | 0.39 | 0.58 | 0.644 |
| 2.390752009381823 | 0.391 | 0.58 | 0.644 |
| 2.393893602035412 | 0.391 | 0.58 | 0.644 |
| 2.397035194689002 | 0.391 | 0.58 | 0.644 |
| 2.400176787342591 | 0.391 | 0.58 | 0.644 |
| 2.403318379996181 | 0.391 | 0.58 | 0.644 |
| 2.406459972649771 | 0.391 | 0.58 | 0.644 |
| 2.40960156530336 | 0.391 | 0.58 | 0.644 |
| 2.41274315795695 | 0.392 | 0.58 | 0.644 |
| 2.41588475061054 | 0.392 | 0.58 | 0.644 |
| 2.419026343264129 | 0.392 | 0.58 | 0.644 |
| 2.422167935917719 | 0.392 | 0.58 | 0.644 |
| 2.425309528571308 | 0.392 | 0.58 | 0.644 |
| 2.428451121224898 | 0.392 | 0.58 | 0.644 |
| 2.431592713878488 | 0.393 | 0.58 | 0.644 |
| 2.434734306532077 | 0.393 | 0.58 | 0.644 |
| 2.437875899185667 | 0.393 | 0.58 | 0.644 |
| 2.441017491839256 | 0.393 | 0.58 | 0.644 |
| 2.444159084492846 | 0.393 | 0.58 | 0.644 |
| 2.447300677146435 | 0.394 | 0.58 | 0.644 |
| 2.450442269800025 | 0.394 | 0.58 | 0.644 |
| 2.453583862453615 | 0.394 | 0.58 | 0.644 |
| 2.456725455107204 | 0.394 | 0.58 | 0.644 |
| 2.459867047760794 | 0.395 | 0.58 | 0.644 |
| 2.463008640414384 | 0.395 | 0.58 | 0.644 |
| 2.466150233067973 | 0.395 | 0.58 | 0.644 |
| 2.469291825721563 | 0.395 | 0.58 | 0.644 |
| 2.472433418375152 | 0.396 | 0.58 | 0.644 |
| 2.475575011028742 | 0.396 | 0.58 | 0.644 |
| 2.478716603682332 | 0.396 | 0.58 | 0.644 |
| 2.481858196335921 | 0.397 | 0.58 | 0.644 |
| 2.48499978898951 | 0.397 | 0.58 | 0.644 |
| 2.4881413816431 | 0.397 | 0.58 | 0.644 |
| 2.49128297429669 | 0.398 | 0.58 | 0.644 |
| 2.49442456695028 | 0.398 | 0.58 | 0.644 |
| 2.497566159603869 | 0.398 | 0.58 | 0.644 |
| 2.500707752257458 | 0.399 | 0.58 | 0.644 |
| 2.503849344911048 | 0.399 | 0.58 | 0.644 |
| 2.506990937564638 | 0.399 | 0.58 | 0.644 |
| 2.510132530218228 | 0.4 | 0.58 | 0.644 |
| 2.513274122871817 | 0.4 | 0.58 | 0.644 |
| 2.516415715525407 | 0.4 | 0.58 | 0.644 |
| 2.519557308178996 | 0.401 | 0.58 | 0.644 |
| 2.522698900832586 | 0.401 | 0.58 | 0.644 |
| 2.525840493486176 | 0.402 | 0.58 | 0.644 |
| 2.528982086139765 | 0.402 | 0.58 | 0.644 |
| 2.532123678793355 | 0.402 | 0.58 | 0.644 |
| 2.535265271446944 | 0.403 | 0.58 | 0.644 |
| 2.538406864100534 | 0.403 | 0.58 | 0.644 |
| 2.541548456754124 | 0.404 | 0.58 | 0.644 |
| 2.544690049407713 | 0.404 | 0.58 | 0.644 |
| 2.547831642061302 | 0.405 | 0.58 | 0.644 |
| 2.550973234714892 | 0.405 | 0.58 | 0.644 |
| 2.554114827368482 | 0.406 | 0.58 | 0.644 |
| 2.557256420022072 | 0.406 | 0.58 | 0.644 |
| 2.560398012675661 | 0.407 | 0.58 | 0.644 |
| 2.563539605329251 | 0.407 | 0.58 | 0.644 |
| 2.56668119798284 | 0.408 | 0.58 | 0.644 |
| 2.56982279063643 | 0.408 | 0.58 | 0.644 |
| 2.57296438329002 | 0.409 | 0.58 | 0.644 |
| 2.576105975943609 | 0.409 | 0.58 | 0.644 |
| 2.579247568597199 | 0.41 | 0.58 | 0.644 |
| 2.582389161250788 | 0.411 | 0.58 | 0.644 |
| 2.585530753904377 | 0.411 | 0.58 | 0.644 |
| 2.588672346557967 | 0.412 | 0.58 | 0.644 |
| 2.591813939211557 | 0.412 | 0.58 | 0.644 |
| 2.594955531865147 | 0.413 | 0.58 | 0.644 |
| 2.598097124518736 | 0.414 | 0.58 | 0.644 |
| 2.601238717172326 | 0.414 | 0.58 | 0.644 |
| 2.604380309825915 | 0.415 | 0.58 | 0.644 |
| 2.607521902479505 | 0.416 | 0.58 | 0.644 |
| 2.610663495133095 | 0.417 | 0.58 | 0.644 |
| 2.613805087786684 | 0.417 | 0.58 | 0.644 |
| 2.616946680440274 | 0.418 | 0.58 | 0.644 |
| 2.620088273093863 | 0.419 | 0.58 | 0.644 |
| 2.623229865747452 | 0.419 | 0.58 | 0.644 |
| 2.626371458401042 | 0.42 | 0.58 | 0.644 |
| 2.629513051054632 | 0.421 | 0.58 | 0.644 |
| 2.632654643708222 | 0.422 | 0.58 | 0.644 |
| 2.635796236361811 | 0.423 | 0.58 | 0.644 |
| 2.638937829015401 | 0.423 | 0.58 | 0.644 |
| 2.642079421668991 | 0.424 | 0.58 | 0.644 |
| 2.64522101432258 | 0.425 | 0.58 | 0.644 |
| 2.64836260697617 | 0.426 | 0.58 | 0.644 |
| 2.651504199629759 | 0.427 | 0.58 | 0.644 |
| 2.654645792283349 | 0.428 | 0.58 | 0.644 |
| 2.657787384936938 | 0.429 | 0.58 | 0.644 |
| 2.660928977590528 | 0.43 | 0.58 | 0.644 |
| 2.664070570244118 | 0.431 | 0.58 | 0.644 |
| 2.667212162897707 | 0.432 | 0.58 | 0.644 |
| 2.670353755551297 | 0.433 | 0.58 | 0.644 |
| 2.673495348204887 | 0.434 | 0.58 | 0.644 |
| 2.676636940858476 | 0.435 | 0.58 | 0.644 |
| 2.679778533512066 | 0.436 | 0.58 | 0.644 |
| 2.682920126165655 | 0.437 | 0.58 | 0.644 |
| 2.686061718819245 | 0.438 | 0.58 | 0.644 |
| 2.689203311472835 | 0.439 | 0.58 | 0.644 |
| 2.692344904126424 | 0.44 | 0.58 | 0.644 |
| 2.695486496780014 | 0.441 | 0.58 | 0.644 |
| 2.698628089433603 | 0.442 | 0.58 | 0.644 |
| 2.701769682087193 | 0.443 | 0.58 | 0.644 |
| 2.704911274740782 | 0.445 | 0.58 | 0.644 |
| 2.708052867394372 | 0.446 | 0.58 | 0.644 |
| 2.711194460047962 | 0.447 | 0.58 | 0.644 |
| 2.714336052701551 | 0.448 | 0.58 | 0.644 |
| 2.717477645355141 | 0.449 | 0.58 | 0.644 |
| 2.720619238008731 | 0.451 | 0.581 | 0.644 |
| 2.72376083066232 | 0.452 | 0.581 | 0.644 |
| 2.72690242331591 | 0.453 | 0.581 | 0.644 |
| 2.730044015969499 | 0.454 | 0.581 | 0.644 |
| 2.733185608623089 | 0.456 | 0.581 | 0.644 |
| 2.736327201276678 | 0.457 | 0.581 | 0.644 |
| 2.739468793930268 | 0.458 | 0.581 | 0.644 |
| 2.742610386583858 | 0.46 | 0.581 | 0.644 |
| 2.745751979237447 | 0.461 | 0.581 | 0.644 |
| 2.748893571891036 | 0.463 | 0.581 | 0.644 |
| 2.752035164544627 | 0.464 | 0.581 | 0.644 |
| 2.755176757198216 | 0.466 | 0.581 | 0.644 |
| 2.758318349851806 | 0.467 | 0.581 | 0.644 |
| 2.761459942505395 | 0.469 | 0.582 | 0.644 |
| 2.764601535158985 | 0.47 | 0.582 | 0.644 |
| 2.767743127812574 | 0.472 | 0.582 | 0.644 |
| 2.770884720466164 | 0.473 | 0.582 | 0.644 |
| 2.774026313119754 | 0.475 | 0.582 | 0.644 |
| 2.777167905773343 | 0.476 | 0.582 | 0.644 |
| 2.780309498426932 | 0.478 | 0.583 | 0.644 |
| 2.783451091080522 | 0.479 | 0.583 | 0.644 |
| 2.786592683734112 | 0.481 | 0.583 | 0.644 |
| 2.789734276387701 | 0.483 | 0.583 | 0.644 |
| 2.792875869041291 | 0.484 | 0.583 | 0.644 |
| 2.796017461694881 | 0.486 | 0.584 | 0.644 |
| 2.79915905434847 | 0.488 | 0.584 | 0.644 |
| 2.80230064700206 | 0.49 | 0.584 | 0.644 |
| 2.80544223965565 | 0.491 | 0.584 | 0.644 |
| 2.808583832309239 | 0.493 | 0.585 | 0.644 |
| 2.811725424962829 | 0.495 | 0.585 | 0.644 |
| 2.814867017616419 | 0.497 | 0.585 | 0.644 |
| 2.818008610270008 | 0.499 | 0.585 | 0.644 |
| 2.821150202923598 | 0.5 | 0.586 | 0.644 |
| 2.824291795577187 | 0.502 | 0.586 | 0.644 |
| 2.827433388230777 | 0.504 | 0.587 | 0.644 |
| 2.830574980884366 | 0.506 | 0.587 | 0.644 |
| 2.833716573537956 | 0.508 | 0.587 | 0.644 |
| 2.836858166191546 | 0.51 | 0.588 | 0.644 |
| 2.839999758845135 | 0.512 | 0.588 | 0.644 |
| 2.843141351498725 | 0.514 | 0.589 | 0.644 |
| 2.846282944152314 | 0.516 | 0.589 | 0.645 |
| 2.849424536805904 | 0.518 | 0.59 | 0.645 |
| 2.852566129459494 | 0.52 | 0.59 | 0.645 |
| 2.855707722113083 | 0.522 | 0.591 | 0.645 |
| 2.858849314766673 | 0.524 | 0.591 | 0.645 |
| 2.861990907420262 | 0.526 | 0.592 | 0.645 |
| 2.865132500073852 | 0.528 | 0.592 | 0.645 |
| 2.868274092727442 | 0.531 | 0.593 | 0.645 |
| 2.871415685381031 | 0.533 | 0.594 | 0.645 |
| 2.874557278034621 | 0.535 | 0.594 | 0.645 |
| 2.87769887068821 | 0.537 | 0.595 | 0.645 |
| 2.8808404633418 | 0.539 | 0.596 | 0.645 |
| 2.88398205599539 | 0.542 | 0.597 | 0.645 |
| 2.88712364864898 | 0.544 | 0.597 | 0.645 |
| 2.890265241302569 | 0.546 | 0.598 | 0.646 |
| 2.893406833956158 | 0.548 | 0.599 | 0.646 |
| 2.896548426609748 | 0.551 | 0.6 | 0.646 |
| 2.899690019263338 | 0.553 | 0.601 | 0.646 |
| 2.902831611916927 | 0.555 | 0.602 | 0.646 |
| 2.905973204570517 | 0.558 | 0.603 | 0.646 |
| 2.909114797224106 | 0.56 | 0.604 | 0.647 |
| 2.912256389877696 | 0.562 | 0.605 | 0.647 |
| 2.915397982531286 | 0.565 | 0.606 | 0.647 |
| 2.918539575184875 | 0.567 | 0.607 | 0.647 |
| 2.921681167838465 | 0.57 | 0.608 | 0.648 |
| 2.924822760492054 | 0.572 | 0.609 | 0.648 |
| 2.927964353145644 | 0.575 | 0.611 | 0.648 |
| 2.931105945799234 | 0.577 | 0.612 | 0.649 |
| 2.934247538452823 | 0.58 | 0.613 | 0.649 |
| 2.937389131106413 | 0.582 | 0.614 | 0.649 |
| 2.940530723760002 | 0.585 | 0.616 | 0.65 |
| 2.943672316413592 | 0.587 | 0.617 | 0.65 |
| 2.946813909067182 | 0.59 | 0.619 | 0.651 |
| 2.949955501720771 | 0.593 | 0.62 | 0.651 |
| 2.953097094374361 | 0.595 | 0.622 | 0.652 |
| 2.95623868702795 | 0.598 | 0.623 | 0.652 |
| 2.95938027968154 | 0.601 | 0.625 | 0.653 |
| 2.96252187233513 | 0.603 | 0.626 | 0.654 |
| 2.965663464988719 | 0.606 | 0.628 | 0.654 |
| 2.968805057642309 | 0.609 | 0.63 | 0.655 |
| 2.971946650295898 | 0.611 | 0.631 | 0.656 |
| 2.975088242949488 | 0.614 | 0.633 | 0.657 |
| 2.978229835603078 | 0.617 | 0.635 | 0.658 |
| 2.981371428256667 | 0.62 | 0.637 | 0.659 |
| 2.984513020910257 | 0.622 | 0.639 | 0.66 |
| 2.987654613563846 | 0.625 | 0.641 | 0.661 |
| 2.990796206217436 | 0.628 | 0.643 | 0.662 |
| 2.993937798871025 | 0.631 | 0.645 | 0.663 |
| 2.997079391524615 | 0.633 | 0.647 | 0.664 |
| 3.000220984178205 | 0.636 | 0.649 | 0.665 |
| 3.003362576831794 | 0.639 | 0.651 | 0.666 |
| 3.006504169485384 | 0.642 | 0.653 | 0.668 |
| 3.009645762138974 | 0.645 | 0.655 | 0.669 |
| 3.012787354792563 | 0.648 | 0.657 | 0.671 |
| 3.015928947446153 | 0.651 | 0.66 | 0.672 |
| 3.019070540099742 | 0.654 | 0.662 | 0.674 |
| 3.022212132753332 | 0.657 | 0.664 | 0.675 |
| 3.025353725406922 | 0.659 | 0.667 | 0.677 |
| 3.028495318060511 | 0.662 | 0.669 | 0.679 |
| 3.031636910714101 | 0.665 | 0.671 | 0.68 |
| 3.03477850336769 | 0.668 | 0.674 | 0.682 |
| 3.03792009602128 | 0.671 | 0.676 | 0.684 |
| 3.04106168867487 | 0.674 | 0.679 | 0.686 |
| 3.04420328132846 | 0.677 | 0.682 | 0.688 |
| 3.047344873982049 | 0.68 | 0.684 | 0.69 |
| 3.050486466635638 | 0.683 | 0.687 | 0.692 |
| 3.053628059289228 | 0.686 | 0.69 | 0.694 |
| 3.056769651942818 | 0.689 | 0.692 | 0.697 |
| 3.059911244596407 | 0.692 | 0.695 | 0.699 |
| 3.063052837249997 | 0.695 | 0.698 | 0.701 |
| 3.066194429903586 | 0.698 | 0.7 | 0.704 |
| 3.069336022557176 | 0.701 | 0.703 | 0.706 |
| 3.072477615210766 | 0.705 | 0.706 | 0.709 |
| 3.075619207864355 | 0.708 | 0.709 | 0.711 |
| 3.078760800517945 | 0.711 | 0.712 | 0.714 |
| 3.081902393171534 | 0.714 | 0.715 | 0.716 |
| 3.085043985825124 | 0.717 | 0.718 | 0.719 |
| 3.088185578478713 | 0.72 | 0.721 | 0.722 |
| 3.091327171132303 | 0.723 | 0.724 | 0.725 |
| 3.094468763785893 | 0.726 | 0.727 | 0.728 |
| 3.097610356439482 | 0.729 | 0.73 | 0.73 |
| 3.100751949093072 | 0.732 | 0.733 | 0.733 |
| 3.103893541746661 | 0.736 | 0.736 | 0.736 |
| 3.107035134400251 | 0.739 | 0.739 | 0.739 |
| 3.110176727053841 | 0.742 | 0.742 | 0.742 |
| 3.11331831970743 | 0.745 | 0.745 | 0.745 |
| 3.11645991236102 | 0.748 | 0.748 | 0.748 |
| 3.11960150501461 | 0.751 | 0.751 | 0.751 |
| 3.122743097668199 | 0.754 | 0.754 | 0.754 |
| 3.125884690321789 | 0.757 | 0.757 | 0.757 |
| 3.129026282975378 | 0.761 | 0.761 | 0.761 |
| 3.132167875628968 | 0.764 | 0.764 | 0.764 |
| 3.135309468282557 | 0.767 | 0.767 | 0.767 |
| 3.138451060936147 | 0.77 | 0.77 | 0.77 |
| 3.141592653589737 | 0.773 | 0.773 | 0.773 |
| 3.144734246243326 | 0.776 | 0.776 | 0.776 |
| 3.147875838896916 | 0.779 | 0.779 | 0.779 |
| 3.151017431550505 | 0.783 | 0.783 | 0.783 |
| 3.154159024204095 | 0.786 | 0.786 | 0.786 |
| 3.157300616857685 | 0.789 | 0.789 | 0.789 |
| 3.160442209511274 | 0.792 | 0.792 | 0.792 |
| 3.163583802164864 | 0.795 | 0.795 | 0.795 |
| 3.166725394818453 | 0.798 | 0.798 | 0.798 |
| 3.169866987472043 | 0.801 | 0.801 | 0.801 |
| 3.173008580125633 | 0.804 | 0.804 | 0.804 |
| 3.176150172779222 | 0.808 | 0.807 | 0.807 |
| 3.179291765432812 | 0.811 | 0.81 | 0.81 |
| 3.182433358086401 | 0.814 | 0.814 | 0.813 |
| 3.185574950739991 | 0.817 | 0.817 | 0.816 |
| 3.188716543393581 | 0.82 | 0.82 | 0.819 |
| 3.19185813604717 | 0.823 | 0.823 | 0.822 |
| 3.19499972870076 | 0.826 | 0.826 | 0.824 |
| 3.198141321354349 | 0.829 | 0.828 | 0.827 |
| 3.20128291400794 | 0.832 | 0.831 | 0.83 |
| 3.204424506661528 | 0.836 | 0.834 | 0.832 |
| 3.207566099315118 | 0.839 | 0.837 | 0.835 |
| 3.210707691968708 | 0.842 | 0.84 | 0.838 |
| 3.213849284622297 | 0.845 | 0.843 | 0.84 |
| 3.216990877275887 | 0.848 | 0.846 | 0.843 |
| 3.220132469929476 | 0.851 | 0.849 | 0.845 |
| 3.223274062583066 | 0.854 | 0.851 | 0.847 |
| 3.226415655236656 | 0.857 | 0.854 | 0.85 |
| 3.229557247890245 | 0.86 | 0.857 | 0.852 |
| 3.232698840543835 | 0.863 | 0.859 | 0.854 |
| 3.235840433197425 | 0.866 | 0.862 | 0.856 |
| 3.238982025851014 | 0.869 | 0.865 | 0.858 |
| 3.242123618504604 | 0.872 | 0.867 | 0.86 |
| 3.245265211158193 | 0.875 | 0.87 | 0.862 |
| 3.248406803811783 | 0.878 | 0.872 | 0.864 |
| 3.251548396465373 | 0.881 | 0.875 | 0.866 |
| 3.254689989118962 | 0.884 | 0.877 | 0.868 |
| 3.257831581772551 | 0.887 | 0.88 | 0.869 |
| 3.260973174426141 | 0.89 | 0.882 | 0.871 |
| 3.26411476707973 | 0.893 | 0.884 | 0.873 |
| 3.267256359733321 | 0.896 | 0.887 | 0.874 |
| 3.27039795238691 | 0.898 | 0.889 | 0.876 |
| 3.2735395450405 | 0.901 | 0.891 | 0.877 |
| 3.276681137694089 | 0.904 | 0.893 | 0.878 |
| 3.279822730347679 | 0.907 | 0.895 | 0.88 |
| 3.282964323001269 | 0.91 | 0.898 | 0.881 |
| 3.286105915654858 | 0.913 | 0.9 | 0.882 |
| 3.289247508308448 | 0.916 | 0.902 | 0.883 |
| 3.292389100962037 | 0.918 | 0.904 | 0.885 |
| 3.295530693615627 | 0.921 | 0.906 | 0.886 |
| 3.298672286269217 | 0.924 | 0.908 | 0.887 |
| 3.301813878922806 | 0.927 | 0.909 | 0.888 |
| 3.304955471576396 | 0.929 | 0.911 | 0.889 |
| 3.308097064229985 | 0.932 | 0.913 | 0.889 |
| 3.311238656883575 | 0.935 | 0.915 | 0.89 |
| 3.314380249537165 | 0.938 | 0.917 | 0.891 |
| 3.317521842190754 | 0.94 | 0.918 | 0.892 |
| 3.320663434844344 | 0.943 | 0.92 | 0.892 |
| 3.323805027497933 | 0.946 | 0.922 | 0.893 |
| 3.326946620151523 | 0.948 | 0.923 | 0.894 |
| 3.330088212805113 | 0.951 | 0.925 | 0.894 |
| 3.333229805458702 | 0.954 | 0.926 | 0.895 |
| 3.336371398112292 | 0.956 | 0.928 | 0.895 |
| 3.339512990765881 | 0.959 | 0.929 | 0.896 |
| 3.342654583419471 | 0.961 | 0.93 | 0.896 |
| 3.345796176073061 | 0.964 | 0.932 | 0.897 |
| 3.34893776872665 | 0.966 | 0.933 | 0.897 |
| 3.35207936138024 | 0.969 | 0.934 | 0.898 |
| 3.355220954033829 | 0.971 | 0.936 | 0.898 |
| 3.358362546687419 | 0.974 | 0.937 | 0.898 |
| 3.361504139341009 | 0.976 | 0.938 | 0.899 |
| 3.364645731994598 | 0.979 | 0.939 | 0.899 |
| 3.367787324648188 | 0.981 | 0.94 | 0.899 |
| 3.370928917301777 | 0.984 | 0.941 | 0.899 |
| 3.374070509955367 | 0.986 | 0.942 | 0.9 |
| 3.377212102608956 | 0.989 | 0.943 | 0.9 |
| 3.380353695262546 | 0.991 | 0.944 | 0.9 |
| 3.383495287916136 | 0.993 | 0.945 | 0.9 |
| 3.386636880569725 | 0.996 | 0.946 | 0.9 |
| 3.389778473223315 | 0.998 | 0.947 | 0.901 |
| 3.392920065876904 | 1 | 0.948 | 0.901 |
| 3.396061658530494 | 1.002 | 0.949 | 0.901 |
| 3.399203251184084 | 1.005 | 0.95 | 0.901 |
| 3.402344843837673 | 1.007 | 0.95 | 0.901 |
| 3.405486436491263 | 1.009 | 0.951 | 0.901 |
| 3.408628029144852 | 1.011 | 0.952 | 0.901 |
| 3.411769621798442 | 1.014 | 0.952 | 0.901 |
| 3.414911214452032 | 1.016 | 0.953 | 0.901 |
| 3.418052807105621 | 1.018 | 0.954 | 0.901 |
| 3.421194399759211 | 1.02 | 0.954 | 0.902 |
| 3.4243359924128 | 1.022 | 0.955 | 0.902 |
| 3.42747758506639 | 1.024 | 0.956 | 0.902 |
| 3.43061917771998 | 1.026 | 0.956 | 0.902 |
| 3.433760770373569 | 1.028 | 0.957 | 0.902 |
| 3.436902363027159 | 1.03 | 0.957 | 0.902 |
| 3.440043955680748 | 1.032 | 0.958 | 0.902 |
| 3.443185548334338 | 1.034 | 0.958 | 0.902 |
| 3.446327140987927 | 1.036 | 0.959 | 0.902 |
| 3.449468733641517 | 1.038 | 0.959 | 0.902 |
| 3.452610326295107 | 1.04 | 0.959 | 0.902 |
| 3.455751918948696 | 1.042 | 0.96 | 0.902 |
| 3.458893511602286 | 1.044 | 0.96 | 0.902 |
| 3.462035104255876 | 1.046 | 0.96 | 0.902 |
| 3.465176696909465 | 1.048 | 0.961 | 0.902 |
| 3.468318289563055 | 1.05 | 0.961 | 0.902 |
| 3.471459882216644 | 1.051 | 0.961 | 0.902 |
| 3.474601474870234 | 1.053 | 0.962 | 0.902 |
| 3.477743067523824 | 1.055 | 0.962 | 0.902 |
| 3.480884660177413 | 1.057 | 0.962 | 0.902 |
| 3.484026252831002 | 1.058 | 0.962 | 0.902 |
| 3.487167845484592 | 1.06 | 0.963 | 0.902 |
| 3.490309438138182 | 1.062 | 0.963 | 0.902 |
| 3.493451030791772 | 1.064 | 0.963 | 0.902 |
| 3.496592623445361 | 1.065 | 0.963 | 0.902 |
| 3.499734216098951 | 1.067 | 0.964 | 0.902 |
| 3.50287580875254 | 1.068 | 0.964 | 0.902 |
| 3.50601740140613 | 1.07 | 0.964 | 0.902 |
| 3.50915899405972 | 1.072 | 0.964 | 0.902 |
| 3.512300586713309 | 1.073 | 0.964 | 0.902 |
| 3.515442179366899 | 1.075 | 0.964 | 0.902 |
| 3.518583772020488 | 1.076 | 0.965 | 0.902 |
| 3.521725364674078 | 1.078 | 0.965 | 0.902 |
| 3.524866957327668 | 1.079 | 0.965 | 0.902 |
| 3.528008549981257 | 1.081 | 0.965 | 0.902 |
| 3.531150142634847 | 1.082 | 0.965 | 0.902 |
| 3.534291735288436 | 1.084 | 0.965 | 0.902 |
| 3.537433327942026 | 1.085 | 0.965 | 0.902 |
| 3.540574920595616 | 1.086 | 0.965 | 0.902 |
| 3.543716513249205 | 1.088 | 0.965 | 0.902 |
| 3.546858105902795 | 1.089 | 0.965 | 0.902 |
| 3.549999698556384 | 1.09 | 0.965 | 0.902 |
| 3.553141291209974 | 1.092 | 0.966 | 0.902 |
| 3.556282883863564 | 1.093 | 0.966 | 0.902 |
| 3.559424476517153 | 1.094 | 0.966 | 0.902 |
| 3.562566069170743 | 1.096 | 0.966 | 0.902 |
| 3.565707661824332 | 1.097 | 0.966 | 0.902 |
| 3.568849254477922 | 1.098 | 0.966 | 0.902 |
| 3.571990847131511 | 1.099 | 0.966 | 0.902 |
| 3.575132439785101 | 1.101 | 0.966 | 0.902 |
| 3.578274032438691 | 1.102 | 0.966 | 0.902 |
| 3.58141562509228 | 1.103 | 0.966 | 0.902 |
| 3.58455721774587 | 1.104 | 0.966 | 0.902 |
| 3.58769881039946 | 1.105 | 0.966 | 0.902 |
| 3.590840403053049 | 1.106 | 0.966 | 0.902 |
| 3.593981995706639 | 1.107 | 0.966 | 0.902 |
| 3.597123588360228 | 1.108 | 0.966 | 0.902 |
| 3.600265181013818 | 1.11 | 0.966 | 0.902 |
| 3.603406773667407 | 1.111 | 0.966 | 0.902 |
| 3.606548366320997 | 1.112 | 0.966 | 0.902 |
| 3.609689958974587 | 1.113 | 0.966 | 0.902 |
| 3.612831551628176 | 1.114 | 0.966 | 0.902 |
| 3.615973144281766 | 1.115 | 0.966 | 0.902 |
| 3.619114736935355 | 1.116 | 0.966 | 0.902 |
| 3.622256329588945 | 1.117 | 0.966 | 0.902 |
| 3.625397922242534 | 1.117 | 0.966 | 0.902 |
| 3.628539514896124 | 1.118 | 0.966 | 0.902 |
| 3.631681107549714 | 1.119 | 0.966 | 0.902 |
| 3.634822700203303 | 1.12 | 0.966 | 0.902 |
| 3.637964292856893 | 1.121 | 0.966 | 0.902 |
| 3.641105885510483 | 1.122 | 0.966 | 0.902 |
| 3.644247478164072 | 1.123 | 0.966 | 0.902 |
| 3.647389070817662 | 1.124 | 0.966 | 0.902 |
| 3.650530663471251 | 1.124 | 0.966 | 0.902 |
| 3.653672256124841 | 1.125 | 0.966 | 0.902 |
| 3.656813848778431 | 1.126 | 0.966 | 0.902 |
| 3.65995544143202 | 1.127 | 0.966 | 0.902 |
| 3.66309703408561 | 1.128 | 0.966 | 0.902 |
| 3.666238626739199 | 1.128 | 0.966 | 0.902 |
| 3.66938021939279 | 1.129 | 0.966 | 0.902 |
| 3.672521812046378 | 1.13 | 0.966 | 0.902 |
| 3.675663404699968 | 1.13 | 0.966 | 0.902 |
| 3.678804997353558 | 1.131 | 0.966 | 0.902 |
| 3.681946590007147 | 1.132 | 0.966 | 0.902 |
| 3.685088182660737 | 1.133 | 0.966 | 0.902 |
| 3.688229775314326 | 1.133 | 0.966 | 0.902 |
| 3.691371367967916 | 1.134 | 0.966 | 0.902 |
| 3.694512960621506 | 1.134 | 0.966 | 0.902 |
| 3.697654553275095 | 1.135 | 0.966 | 0.902 |
| 3.700796145928685 | 1.136 | 0.966 | 0.902 |
| 3.703937738582274 | 1.136 | 0.966 | 0.902 |
| 3.707079331235864 | 1.137 | 0.966 | 0.902 |
| 3.710220923889454 | 1.137 | 0.966 | 0.902 |
| 3.713362516543043 | 1.138 | 0.966 | 0.902 |
| 3.716504109196633 | 1.139 | 0.966 | 0.902 |
| 3.719645701850223 | 1.139 | 0.966 | 0.902 |
| 3.722787294503812 | 1.14 | 0.966 | 0.902 |
| 3.725928887157402 | 1.14 | 0.966 | 0.902 |
| 3.729070479810991 | 1.141 | 0.966 | 0.902 |
| 3.732212072464581 | 1.141 | 0.966 | 0.902 |
| 3.735353665118171 | 1.142 | 0.966 | 0.902 |
| 3.73849525777176 | 1.142 | 0.966 | 0.902 |
| 3.74163685042535 | 1.143 | 0.966 | 0.902 |
| 3.744778443078939 | 1.143 | 0.966 | 0.902 |
| 3.747920035732529 | 1.143 | 0.966 | 0.902 |
| 3.751061628386119 | 1.144 | 0.966 | 0.902 |
| 3.754203221039708 | 1.144 | 0.966 | 0.902 |
| 3.757344813693298 | 1.145 | 0.966 | 0.902 |
| 3.760486406346887 | 1.145 | 0.966 | 0.902 |
| 3.763627999000477 | 1.146 | 0.966 | 0.902 |
| 3.766769591654067 | 1.146 | 0.966 | 0.902 |
| 3.769911184307656 | 1.146 | 0.966 | 0.902 |
| 3.773052776961246 | 1.147 | 0.966 | 0.902 |
| 3.776194369614835 | 1.147 | 0.966 | 0.902 |
| 3.779335962268425 | 1.147 | 0.966 | 0.902 |
| 3.782477554922014 | 1.148 | 0.966 | 0.902 |
| 3.785619147575604 | 1.148 | 0.966 | 0.902 |
| 3.788760740229193 | 1.148 | 0.966 | 0.902 |
| 3.791902332882783 | 1.149 | 0.966 | 0.902 |
| 3.795043925536373 | 1.149 | 0.966 | 0.902 |
| 3.798185518189962 | 1.149 | 0.966 | 0.902 |
| 3.801327110843552 | 1.15 | 0.966 | 0.902 |
| 3.804468703497142 | 1.15 | 0.966 | 0.902 |
| 3.807610296150731 | 1.15 | 0.966 | 0.902 |
| 3.810751888804321 | 1.151 | 0.966 | 0.902 |
| 3.813893481457911 | 1.151 | 0.966 | 0.902 |
| 3.8170350741115 | 1.151 | 0.966 | 0.902 |
| 3.82017666676509 | 1.151 | 0.966 | 0.902 |
| 3.823318259418679 | 1.152 | 0.966 | 0.902 |
| 3.826459852072269 | 1.152 | 0.966 | 0.902 |
| 3.829601444725859 | 1.152 | 0.966 | 0.902 |
| 3.832743037379448 | 1.152 | 0.966 | 0.902 |
| 3.835884630033038 | 1.153 | 0.966 | 0.902 |
| 3.839026222686627 | 1.153 | 0.966 | 0.902 |
| 3.842167815340217 | 1.153 | 0.966 | 0.902 |
| 3.845309407993807 | 1.153 | 0.966 | 0.902 |
| 3.848451000647396 | 1.153 | 0.966 | 0.902 |
| 3.851592593300986 | 1.154 | 0.966 | 0.902 |
| 3.854734185954575 | 1.154 | 0.966 | 0.902 |
| 3.857875778608165 | 1.154 | 0.966 | 0.902 |
| 3.861017371261755 | 1.154 | 0.966 | 0.902 |
| 3.864158963915344 | 1.154 | 0.966 | 0.902 |
| 3.867300556568933 | 1.155 | 0.966 | 0.902 |
| 3.870442149222523 | 1.155 | 0.966 | 0.902 |
| 3.873583741876112 | 1.155 | 0.966 | 0.902 |
| 3.876725334529703 | 1.155 | 0.966 | 0.902 |
| 3.879866927183292 | 1.155 | 0.966 | 0.902 |
| 3.883008519836882 | 1.155 | 0.966 | 0.902 |
| 3.886150112490471 | 1.155 | 0.966 | 0.902 |
| 3.889291705144061 | 1.156 | 0.966 | 0.902 |
| 3.892433297797651 | 1.156 | 0.966 | 0.902 |
| 3.89557489045124 | 1.156 | 0.966 | 0.902 |
| 3.89871648310483 | 1.156 | 0.966 | 0.902 |
| 3.901858075758419 | 1.156 | 0.966 | 0.902 |
| 3.904999668412009 | 1.156 | 0.966 | 0.902 |
| 3.908141261065598 | 1.156 | 0.966 | 0.902 |
| 3.911282853719188 | 1.157 | 0.966 | 0.902 |
| 3.914424446372778 | 1.157 | 0.966 | 0.903 |
| 3.917566039026367 | 1.157 | 0.966 | 0.903 |
| 3.920707631679957 | 1.157 | 0.966 | 0.903 |
| 3.923849224333547 | 1.157 | 0.966 | 0.903 |
| 3.926990816987136 | 1.157 | 0.966 | 0.903 |
| 3.930132409640726 | 1.157 | 0.966 | 0.903 |
| 3.933274002294315 | 1.157 | 0.966 | 0.903 |
| 3.936415594947905 | 1.157 | 0.966 | 0.903 |
| 3.939557187601495 | 1.157 | 0.966 | 0.903 |
| 3.942698780255084 | 1.157 | 0.966 | 0.903 |
| 3.945840372908674 | 1.158 | 0.966 | 0.904 |
| 3.948981965562263 | 1.158 | 0.966 | 0.904 |
| 3.952123558215853 | 1.158 | 0.966 | 0.904 |
| 3.955265150869442 | 1.158 | 0.966 | 0.904 |
| 3.958406743523032 | 1.158 | 0.966 | 0.904 |
| 3.961548336176622 | 1.158 | 0.966 | 0.905 |
| 3.964689928830211 | 1.158 | 0.966 | 0.905 |
| 3.967831521483801 | 1.158 | 0.966 | 0.905 |
| 3.97097311413739 | 1.158 | 0.966 | 0.906 |
| 3.97411470679098 | 1.158 | 0.966 | 0.906 |
| 3.97725629944457 | 1.158 | 0.966 | 0.906 |
| 3.98039789209816 | 1.158 | 0.966 | 0.907 |
| 3.983539484751749 | 1.158 | 0.966 | 0.907 |
| 3.986681077405338 | 1.158 | 0.966 | 0.907 |
| 3.989822670058928 | 1.158 | 0.966 | 0.908 |
| 3.992964262712517 | 1.159 | 0.966 | 0.908 |
| 3.996105855366107 | 1.159 | 0.966 | 0.909 |
| 3.999247448019697 | 1.159 | 0.966 | 0.909 |
| 4.002389040673287 | 1.159 | 0.966 | 0.91 |
| 4.005530633326877 | 1.159 | 0.966 | 0.911 |
| 4.008672225980466 | 1.159 | 0.966 | 0.911 |
| 4.011813818634056 | 1.159 | 0.966 | 0.912 |
| 4.014955411287645 | 1.159 | 0.966 | 0.913 |
| 4.018097003941234 | 1.159 | 0.966 | 0.913 |
| 4.021238596594824 | 1.159 | 0.966 | 0.914 |
| 4.024380189248414 | 1.159 | 0.966 | 0.915 |
| 4.027521781902004 | 1.159 | 0.966 | 0.916 |
| 4.030663374555593 | 1.159 | 0.966 | 0.917 |
| 4.033804967209183 | 1.159 | 0.966 | 0.918 |
| 4.036946559862773 | 1.159 | 0.966 | 0.919 |
| 4.040088152516362 | 1.159 | 0.966 | 0.92 |
| 4.043229745169951 | 1.159 | 0.966 | 0.921 |
| 4.046371337823541 | 1.159 | 0.966 | 0.922 |
| 4.049512930477131 | 1.159 | 0.966 | 0.924 |
| 4.05265452313072 | 1.159 | 0.966 | 0.925 |
| 4.05579611578431 | 1.159 | 0.966 | 0.926 |
| 4.0589377084379 | 1.159 | 0.966 | 0.928 |
| 4.062079301091489 | 1.159 | 0.966 | 0.929 |
| 4.065220893745079 | 1.159 | 0.966 | 0.931 |
| 4.068362486398668 | 1.159 | 0.966 | 0.932 |
| 4.071504079052258 | 1.159 | 0.966 | 0.934 |
| 4.074645671705848 | 1.159 | 0.966 | 0.936 |
| 4.077787264359437 | 1.159 | 0.966 | 0.937 |
| 4.080928857013027 | 1.159 | 0.966 | 0.939 |
| 4.084070449666616 | 1.159 | 0.966 | 0.941 |
| 4.087212042320206 | 1.159 | 0.966 | 0.943 |
| 4.090353634973795 | 1.159 | 0.966 | 0.945 |
| 4.093495227627385 | 1.159 | 0.966 | 0.947 |
| 4.096636820280975 | 1.159 | 0.966 | 0.949 |
| 4.099778412934564 | 1.159 | 0.966 | 0.951 |
| 4.102920005588154 | 1.159 | 0.966 | 0.954 |
| 4.106061598241744 | 1.159 | 0.966 | 0.956 |
| 4.109203190895333 | 1.159 | 0.966 | 0.958 |
| 4.112344783548923 | 1.159 | 0.966 | 0.961 |
| 4.115486376202512 | 1.16 | 0.966 | 0.963 |
| 4.118627968856102 | 1.16 | 0.966 | 0.966 |
| 4.121769561509692 | 1.16 | 0.966 | 0.968 |
| 4.124911154163281 | 1.16 | 0.966 | 0.971 |
| 4.128052746816871 | 1.16 | 0.966 | 0.973 |
| 4.13119433947046 | 1.16 | 0.966 | 0.976 |
| 4.13433593212405 | 1.16 | 0.966 | 0.979 |
| 4.13747752477764 | 1.16 | 0.966 | 0.981 |
| 4.14061911743123 | 1.16 | 0.966 | 0.984 |
| 4.143760710084818 | 1.16 | 0.966 | 0.987 |
| 4.146902302738408 | 1.16 | 0.966 | 0.99 |
| 4.150043895391998 | 1.16 | 0.966 | 0.993 |
| 4.153185488045588 | 1.16 | 0.966 | 0.996 |
| 4.156327080699177 | 1.16 | 0.966 | 0.999 |
| 4.159468673352766 | 1.16 | 0.966 | 1.002 |
| 4.162610266006356 | 1.16 | 0.966 | 1.005 |
| 4.165751858659946 | 1.16 | 0.966 | 1.008 |
| 4.168893451313535 | 1.16 | 0.966 | 1.011 |
| 4.172035043967125 | 1.16 | 0.966 | 1.014 |
| 4.175176636620715 | 1.16 | 0.966 | 1.017 |
| 4.178318229274304 | 1.16 | 0.966 | 1.02 |
| 4.181459821927894 | 1.16 | 0.966 | 1.024 |
| 4.184601414581484 | 1.16 | 0.966 | 1.027 |
| 4.187743007235073 | 1.16 | 0.966 | 1.03 |
| 4.190884599888663 | 1.16 | 0.966 | 1.033 |
| 4.194026192542252 | 1.16 | 0.966 | 1.036 |
| 4.197167785195842 | 1.16 | 0.966 | 1.039 |
| 4.200309377849432 | 1.16 | 0.966 | 1.042 |
| 4.203450970503021 | 1.16 | 0.966 | 1.045 |
| 4.206592563156611 | 1.16 | 0.966 | 1.049 |
| 4.2097341558102 | 1.16 | 0.966 | 1.052 |
| 4.21287574846379 | 1.16 | 0.966 | 1.055 |
| 4.21601734111738 | 1.16 | 0.966 | 1.058 |
| 4.21915893377097 | 1.16 | 0.966 | 1.061 |
| 4.222300526424559 | 1.16 | 0.966 | 1.064 |
| 4.225442119078148 | 1.16 | 0.967 | 1.067 |
| 4.228583711731738 | 1.16 | 0.967 | 1.07 |
| 4.231725304385327 | 1.16 | 0.967 | 1.073 |
| 4.234866897038917 | 1.16 | 0.967 | 1.075 |
| 4.238008489692506 | 1.16 | 0.967 | 1.078 |
| 4.241150082346096 | 1.16 | 0.967 | 1.081 |
| 4.244291674999685 | 1.16 | 0.967 | 1.084 |
| 4.247433267653276 | 1.16 | 0.967 | 1.087 |
| 4.250574860306865 | 1.16 | 0.967 | 1.089 |
| 4.253716452960455 | 1.16 | 0.967 | 1.092 |
| 4.256858045614044 | 1.16 | 0.967 | 1.094 |
| 4.259999638267634 | 1.16 | 0.967 | 1.097 |
| 4.263141230921224 | 1.16 | 0.967 | 1.099 |
| 4.266282823574813 | 1.16 | 0.967 | 1.102 |
| 4.269424416228403 | 1.16 | 0.967 | 1.104 |
| 4.272566008881992 | 1.16 | 0.967 | 1.107 |
| 4.275707601535582 | 1.16 | 0.967 | 1.109 |
| 4.27884919418917 | 1.16 | 0.967 | 1.111 |
| 4.28199078684276 | 1.16 | 0.967 | 1.113 |
| 4.285132379496351 | 1.16 | 0.967 | 1.115 |
| 4.28827397214994 | 1.16 | 0.967 | 1.117 |
| 4.29141556480353 | 1.16 | 0.967 | 1.119 |
| 4.294557157457119 | 1.16 | 0.967 | 1.121 |
| 4.29769875011071 | 1.16 | 0.967 | 1.123 |
| 4.300840342764299 | 1.16 | 0.967 | 1.125 |
| 4.303981935417888 | 1.16 | 0.967 | 1.127 |
| 4.307123528071478 | 1.16 | 0.967 | 1.128 |
| 4.310265120725067 | 1.16 | 0.967 | 1.13 |
| 4.313406713378657 | 1.16 | 0.968 | 1.131 |
| 4.316548306032247 | 1.16 | 0.968 | 1.133 |
| 4.319689898685836 | 1.16 | 0.968 | 1.134 |
| 4.322831491339426 | 1.16 | 0.968 | 1.136 |
| 4.325973083993015 | 1.16 | 0.968 | 1.137 |
| 4.329114676646605 | 1.16 | 0.968 | 1.138 |
| 4.332256269300195 | 1.16 | 0.968 | 1.14 |
| 4.335397861953784 | 1.16 | 0.968 | 1.141 |
| 4.338539454607374 | 1.16 | 0.968 | 1.142 |
| 4.341681047260963 | 1.16 | 0.969 | 1.143 |
| 4.344822639914553 | 1.16 | 0.969 | 1.144 |
| 4.347964232568143 | 1.16 | 0.969 | 1.145 |
| 4.351105825221732 | 1.16 | 0.969 | 1.146 |
| 4.354247417875322 | 1.16 | 0.969 | 1.147 |
| 4.357389010528911 | 1.16 | 0.969 | 1.148 |
| 4.360530603182501 | 1.16 | 0.97 | 1.148 |
| 4.36367219583609 | 1.16 | 0.97 | 1.149 |
| 4.36681378848968 | 1.16 | 0.97 | 1.15 |
| 4.36995538114327 | 1.16 | 0.97 | 1.151 |
| 4.373096973796859 | 1.16 | 0.971 | 1.151 |
| 4.376238566450449 | 1.16 | 0.971 | 1.152 |
| 4.379380159104038 | 1.16 | 0.971 | 1.152 |
| 4.382521751757628 | 1.16 | 0.971 | 1.153 |
| 4.385663344411217 | 1.16 | 0.972 | 1.153 |
| 4.388804937064807 | 1.16 | 0.972 | 1.154 |
| 4.391946529718397 | 1.16 | 0.972 | 1.154 |
| 4.395088122371987 | 1.16 | 0.973 | 1.155 |
| 4.398229715025576 | 1.16 | 0.973 | 1.155 |
| 4.401371307679165 | 1.16 | 0.973 | 1.156 |
| 4.404512900332755 | 1.16 | 0.974 | 1.156 |
| 4.407654492986345 | 1.16 | 0.974 | 1.156 |
| 4.410796085639934 | 1.16 | 0.975 | 1.157 |
| 4.413937678293524 | 1.16 | 0.975 | 1.157 |
| 4.417079270947114 | 1.16 | 0.976 | 1.157 |
| 4.420220863600703 | 1.16 | 0.976 | 1.157 |
| 4.423362456254293 | 1.16 | 0.977 | 1.158 |
| 4.426504048907883 | 1.16 | 0.977 | 1.158 |
| 4.429645641561472 | 1.16 | 0.978 | 1.158 |
| 4.432787234215062 | 1.16 | 0.978 | 1.158 |
| 4.435928826868651 | 1.16 | 0.979 | 1.158 |
| 4.43907041952224 | 1.16 | 0.98 | 1.158 |
| 4.44221201217583 | 1.16 | 0.98 | 1.159 |
| 4.44535360482942 | 1.16 | 0.981 | 1.159 |
| 4.44849519748301 | 1.16 | 0.982 | 1.159 |
| 4.4516367901366 | 1.16 | 0.982 | 1.159 |
| 4.454778382790188 | 1.16 | 0.983 | 1.159 |
| 4.457919975443779 | 1.16 | 0.984 | 1.159 |
| 4.461061568097368 | 1.16 | 0.985 | 1.159 |
| 4.464203160750958 | 1.16 | 0.986 | 1.159 |
| 4.467344753404547 | 1.16 | 0.987 | 1.159 |
| 4.470486346058137 | 1.16 | 0.988 | 1.159 |
| 4.473627938711726 | 1.16 | 0.988 | 1.159 |
| 4.476769531365316 | 1.16 | 0.989 | 1.159 |
| 4.479911124018905 | 1.16 | 0.99 | 1.159 |
| 4.483052716672495 | 1.16 | 0.991 | 1.159 |
| 4.486194309326085 | 1.16 | 0.993 | 1.159 |
| 4.489335901979674 | 1.16 | 0.994 | 1.159 |
| 4.492477494633264 | 1.16 | 0.995 | 1.16 |
| 4.495619087286854 | 1.16 | 0.996 | 1.16 |
| 4.498760679940443 | 1.16 | 0.997 | 1.16 |
| 4.501902272594033 | 1.16 | 0.998 | 1.16 |
| 4.505043865247622 | 1.16 | 1 | 1.16 |
| 4.508185457901212 | 1.16 | 1.001 | 1.16 |
| 4.511327050554801 | 1.16 | 1.002 | 1.16 |
| 4.514468643208391 | 1.16 | 1.004 | 1.16 |
| 4.517610235861981 | 1.16 | 1.005 | 1.16 |
| 4.520751828515571 | 1.16 | 1.007 | 1.16 |
| 4.52389342116916 | 1.16 | 1.008 | 1.16 |
| 4.52703501382275 | 1.16 | 1.01 | 1.16 |
| 4.530176606476339 | 1.16 | 1.011 | 1.16 |
| 4.533318199129928 | 1.16 | 1.013 | 1.16 |
| 4.536459791783518 | 1.16 | 1.015 | 1.16 |
| 4.539601384437108 | 1.16 | 1.016 | 1.16 |
| 4.542742977090698 | 1.16 | 1.018 | 1.16 |
| 4.545884569744287 | 1.16 | 1.02 | 1.16 |
| 4.549026162397876 | 1.16 | 1.021 | 1.16 |
| 4.552167755051466 | 1.16 | 1.023 | 1.16 |
| 4.555309347705056 | 1.16 | 1.025 | 1.16 |
| 4.558450940358646 | 1.16 | 1.027 | 1.16 |
| 4.561592533012235 | 1.16 | 1.029 | 1.16 |
| 4.564734125665825 | 1.16 | 1.031 | 1.16 |
| 4.567875718319415 | 1.16 | 1.033 | 1.16 |
| 4.571017310973004 | 1.16 | 1.035 | 1.16 |
| 4.574158903626594 | 1.16 | 1.037 | 1.16 |
| 4.577300496280183 | 1.16 | 1.039 | 1.16 |
| 4.580442088933772 | 1.16 | 1.042 | 1.16 |
| 4.583583681587362 | 1.16 | 1.044 | 1.16 |
| 4.586725274240952 | 1.16 | 1.046 | 1.16 |
| 4.589866866894542 | 1.16 | 1.048 | 1.16 |
| 4.593008459548131 | 1.16 | 1.051 | 1.16 |
| 4.596150052201721 | 1.16 | 1.053 | 1.16 |
| 4.59929164485531 | 1.16 | 1.056 | 1.16 |
| 4.6024332375089 | 1.16 | 1.058 | 1.16 |
| 4.60557483016249 | 1.16 | 1.061 | 1.16 |
| 4.608716422816079 | 1.16 | 1.063 | 1.16 |
| 4.611858015469668 | 1.16 | 1.066 | 1.16 |
| 4.614999608123258 | 1.16 | 1.068 | 1.16 |
| 4.618141200776848 | 1.16 | 1.071 | 1.16 |
| 4.621282793430437 | 1.16 | 1.073 | 1.16 |
| 4.624424386084027 | 1.16 | 1.076 | 1.16 |
| 4.627565978737617 | 1.16 | 1.079 | 1.16 |
| 4.630707571391206 | 1.16 | 1.082 | 1.16 |
| 4.633849164044795 | 1.16 | 1.084 | 1.16 |
| 4.636990756698386 | 1.16 | 1.087 | 1.16 |
| 4.640132349351975 | 1.16 | 1.09 | 1.16 |
| 4.643273942005564 | 1.16 | 1.093 | 1.16 |
| 4.646415534659154 | 1.16 | 1.096 | 1.16 |
| 4.649557127312744 | 1.16 | 1.098 | 1.16 |
| 4.652698719966334 | 1.16 | 1.101 | 1.16 |
| 4.655840312619923 | 1.16 | 1.104 | 1.16 |
| 4.658981905273513 | 1.16 | 1.107 | 1.16 |
| 4.662123497927102 | 1.16 | 1.11 | 1.16 |
| 4.665265090580692 | 1.16 | 1.113 | 1.16 |
| 4.668406683234282 | 1.16 | 1.116 | 1.16 |
| 4.671548275887871 | 1.16 | 1.119 | 1.16 |
| 4.674689868541461 | 1.16 | 1.122 | 1.16 |
| 4.67783146119505 | 1.16 | 1.125 | 1.16 |
| 4.68097305384864 | 1.16 | 1.128 | 1.16 |
| 4.68411464650223 | 1.16 | 1.132 | 1.16 |
| 4.687256239155819 | 1.16 | 1.135 | 1.16 |
| 4.690397831809409 | 1.16 | 1.138 | 1.16 |
| 4.693539424462998 | 1.16 | 1.141 | 1.16 |
| 4.696681017116588 | 1.16 | 1.144 | 1.16 |
| 4.699822609770177 | 1.16 | 1.147 | 1.16 |
| 4.702964202423767 | 1.16 | 1.15 | 1.16 |
| 4.706105795077356 | 1.16 | 1.153 | 1.16 |
| 4.709247387730946 | 1.16 | 1.157 | 1.16 |
| 4.712388980384535 | 1.16 | 1.16 | 1.16 |
| 4.715530573038126 | 1.16 | 1.163 | 1.16 |
| 4.718672165691715 | 1.16 | 1.166 | 1.16 |
| 4.721813758345305 | 1.16 | 1.169 | 1.16 |
| 4.724955350998894 | 1.16 | 1.172 | 1.16 |
| 4.728096943652484 | 1.16 | 1.175 | 1.16 |
| 4.731238536306074 | 1.16 | 1.178 | 1.16 |
| 4.734380128959663 | 1.16 | 1.182 | 1.16 |
| 4.737521721613253 | 1.16 | 1.185 | 1.16 |
| 4.740663314266842 | 1.16 | 1.188 | 1.16 |
| 4.743804906920432 | 1.16 | 1.191 | 1.16 |
| 4.74694649957402 | 1.16 | 1.194 | 1.16 |
| 4.750088092227611 | 1.16 | 1.197 | 1.16 |
| 4.7532296848812 | 1.16 | 1.2 | 1.16 |
| 4.75637127753479 | 1.16 | 1.203 | 1.16 |
| 4.75951287018838 | 1.16 | 1.206 | 1.16 |
| 4.76265446284197 | 1.16 | 1.209 | 1.16 |
| 4.765796055495559 | 1.16 | 1.212 | 1.16 |
| 4.768937648149149 | 1.16 | 1.215 | 1.16 |
| 4.772079240802738 | 1.16 | 1.218 | 1.16 |
| 4.775220833456327 | 1.16 | 1.221 | 1.16 |
| 4.778362426109917 | 1.16 | 1.224 | 1.16 |
| 4.781504018763507 | 1.16 | 1.227 | 1.16 |
| 4.784645611417097 | 1.16 | 1.23 | 1.16 |
| 4.787787204070686 | 1.16 | 1.232 | 1.16 |
| 4.790928796724275 | 1.16 | 1.235 | 1.16 |
| 4.794070389377865 | 1.16 | 1.238 | 1.16 |
| 4.797211982031455 | 1.16 | 1.241 | 1.16 |
| 4.800353574685045 | 1.16 | 1.243 | 1.16 |
| 4.803495167338634 | 1.16 | 1.246 | 1.16 |
| 4.806636759992224 | 1.16 | 1.249 | 1.16 |
| 4.809778352645814 | 1.16 | 1.251 | 1.16 |
| 4.812919945299403 | 1.16 | 1.254 | 1.16 |
| 4.816061537952993 | 1.16 | 1.256 | 1.16 |
| 4.819203130606582 | 1.16 | 1.259 | 1.16 |
| 4.822344723260172 | 1.16 | 1.261 | 1.16 |
| 4.825486315913761 | 1.16 | 1.264 | 1.16 |
| 4.828627908567351 | 1.16 | 1.266 | 1.16 |
| 4.83176950122094 | 1.16 | 1.269 | 1.16 |
| 4.83491109387453 | 1.16 | 1.271 | 1.16 |
| 4.83805268652812 | 1.16 | 1.273 | 1.16 |
| 4.841194279181709 | 1.16 | 1.275 | 1.16 |
| 4.844335871835299 | 1.16 | 1.278 | 1.16 |
| 4.847477464488889 | 1.16 | 1.28 | 1.16 |
| 4.850619057142478 | 1.16 | 1.282 | 1.16 |
| 4.853760649796068 | 1.16 | 1.284 | 1.16 |
| 4.856902242449657 | 1.16 | 1.286 | 1.16 |
| 4.860043835103247 | 1.16 | 1.288 | 1.16 |
| 4.863185427756837 | 1.16 | 1.29 | 1.16 |
| 4.866327020410426 | 1.16 | 1.292 | 1.16 |
| 4.869468613064015 | 1.16 | 1.294 | 1.16 |
| 4.872610205717605 | 1.16 | 1.296 | 1.16 |
| 4.875751798371195 | 1.16 | 1.298 | 1.16 |
| 4.878893391024784 | 1.16 | 1.3 | 1.16 |
| 4.882034983678374 | 1.16 | 1.301 | 1.16 |
| 4.885176576331964 | 1.16 | 1.303 | 1.16 |
| 4.888318168985553 | 1.16 | 1.305 | 1.16 |
| 4.891459761639143 | 1.16 | 1.307 | 1.16 |
| 4.894601354292733 | 1.16 | 1.308 | 1.16 |
| 4.897742946946322 | 1.16 | 1.31 | 1.16 |
| 4.900884539599912 | 1.16 | 1.311 | 1.16 |
| 4.904026132253501 | 1.16 | 1.313 | 1.16 |
| 4.907167724907091 | 1.16 | 1.314 | 1.16 |
| 4.91030931756068 | 1.16 | 1.316 | 1.16 |
| 4.91345091021427 | 1.16 | 1.317 | 1.16 |
| 4.91659250286786 | 1.16 | 1.318 | 1.16 |
| 4.91973409552145 | 1.16 | 1.32 | 1.16 |
| 4.922875688175039 | 1.16 | 1.321 | 1.16 |
| 4.926017280828628 | 1.16 | 1.322 | 1.16 |
| 4.929158873482218 | 1.16 | 1.323 | 1.16 |
| 4.932300466135808 | 1.16 | 1.325 | 1.16 |
| 4.935442058789397 | 1.16 | 1.326 | 1.16 |
| 4.938583651442987 | 1.16 | 1.327 | 1.16 |
| 4.941725244096576 | 1.16 | 1.328 | 1.16 |
| 4.944866836750166 | 1.16 | 1.329 | 1.16 |
| 4.948008429403755 | 1.16 | 1.33 | 1.16 |
| 4.951150022057345 | 1.16 | 1.331 | 1.16 |
| 4.954291614710935 | 1.16 | 1.332 | 1.16 |
| 4.957433207364524 | 1.16 | 1.333 | 1.16 |
| 4.960574800018114 | 1.16 | 1.334 | 1.16 |
| 4.963716392671704 | 1.16 | 1.335 | 1.16 |
| 4.966857985325293 | 1.16 | 1.335 | 1.16 |
| 4.969999577978883 | 1.16 | 1.336 | 1.16 |
| 4.973141170632472 | 1.16 | 1.337 | 1.161 |
| 4.976282763286062 | 1.16 | 1.338 | 1.161 |
| 4.979424355939651 | 1.16 | 1.338 | 1.161 |
| 4.982565948593241 | 1.16 | 1.339 | 1.161 |
| 4.985707541246831 | 1.16 | 1.34 | 1.161 |
| 4.98884913390042 | 1.16 | 1.34 | 1.161 |
| 4.99199072655401 | 1.16 | 1.341 | 1.161 |
| 4.9951323192076 | 1.16 | 1.342 | 1.161 |
| 4.99827391186119 | 1.16 | 1.342 | 1.162 |
| 5.00141550451478 | 1.16 | 1.343 | 1.162 |
| 5.004557097168369 | 1.16 | 1.343 | 1.162 |
| 5.007698689821958 | 1.16 | 1.344 | 1.162 |
| 5.010840282475548 | 1.16 | 1.344 | 1.163 |
| 5.013981875129137 | 1.16 | 1.345 | 1.163 |
| 5.017123467782727 | 1.16 | 1.345 | 1.163 |
| 5.020265060436317 | 1.16 | 1.345 | 1.163 |
| 5.023406653089906 | 1.16 | 1.346 | 1.164 |
| 5.026548245743496 | 1.16 | 1.346 | 1.164 |
| 5.029689838397085 | 1.16 | 1.347 | 1.165 |
| 5.032831431050674 | 1.16 | 1.347 | 1.165 |
| 5.035973023704264 | 1.16 | 1.347 | 1.165 |
| 5.039114616357854 | 1.16 | 1.348 | 1.166 |
| 5.042256209011444 | 1.16 | 1.348 | 1.166 |
| 5.045397801665033 | 1.16 | 1.348 | 1.167 |
| 5.048539394318622 | 1.16 | 1.349 | 1.168 |
| 5.051680986972213 | 1.16 | 1.349 | 1.168 |
| 5.054822579625802 | 1.16 | 1.349 | 1.169 |
| 5.057964172279392 | 1.16 | 1.349 | 1.169 |
| 5.061105764932981 | 1.16 | 1.35 | 1.17 |
| 5.064247357586571 | 1.16 | 1.35 | 1.171 |
| 5.067388950240161 | 1.16 | 1.35 | 1.172 |
| 5.07053054289375 | 1.16 | 1.35 | 1.173 |
| 5.07367213554734 | 1.16 | 1.35 | 1.173 |
| 5.07681372820093 | 1.16 | 1.35 | 1.174 |
| 5.079955320854519 | 1.16 | 1.351 | 1.175 |
| 5.083096913508108 | 1.16 | 1.351 | 1.176 |
| 5.086238506161698 | 1.16 | 1.351 | 1.177 |
| 5.089380098815288 | 1.16 | 1.351 | 1.179 |
| 5.092521691468877 | 1.16 | 1.351 | 1.18 |
| 5.095663284122466 | 1.16 | 1.351 | 1.181 |
| 5.098804876776057 | 1.16 | 1.351 | 1.182 |
| 5.101946469429646 | 1.16 | 1.352 | 1.184 |
| 5.105088062083236 | 1.16 | 1.352 | 1.185 |
| 5.108229654736825 | 1.16 | 1.352 | 1.187 |
| 5.111371247390415 | 1.16 | 1.352 | 1.188 |
| 5.114512840044005 | 1.16 | 1.352 | 1.19 |
| 5.117654432697594 | 1.16 | 1.352 | 1.191 |
| 5.120796025351184 | 1.16 | 1.352 | 1.193 |
| 5.123937618004773 | 1.16 | 1.352 | 1.195 |
| 5.127079210658363 | 1.16 | 1.352 | 1.196 |
| 5.130220803311953 | 1.16 | 1.352 | 1.198 |
| 5.133362395965542 | 1.16 | 1.352 | 1.2 |
| 5.136503988619131 | 1.16 | 1.352 | 1.202 |
| 5.13964558127272 | 1.16 | 1.352 | 1.204 |
| 5.142787173926311 | 1.16 | 1.352 | 1.206 |
| 5.1459287665799 | 1.16 | 1.352 | 1.208 |
| 5.14907035923349 | 1.16 | 1.353 | 1.211 |
| 5.15221195188708 | 1.16 | 1.353 | 1.213 |
| 5.15535354454067 | 1.16 | 1.353 | 1.215 |
| 5.158495137194259 | 1.16 | 1.353 | 1.218 |
| 5.161636729847848 | 1.16 | 1.353 | 1.22 |
| 5.164778322501438 | 1.16 | 1.353 | 1.222 |
| 5.167919915155028 | 1.16 | 1.353 | 1.225 |
| 5.171061507808617 | 1.16 | 1.353 | 1.228 |
| 5.174203100462206 | 1.16 | 1.353 | 1.23 |
| 5.177344693115796 | 1.16 | 1.353 | 1.233 |
| 5.180486285769386 | 1.16 | 1.353 | 1.236 |
| 5.183627878422976 | 1.16 | 1.353 | 1.238 |
| 5.186769471076565 | 1.16 | 1.353 | 1.241 |
| 5.189911063730155 | 1.16 | 1.353 | 1.244 |
| 5.193052656383744 | 1.16 | 1.353 | 1.247 |
| 5.196194249037334 | 1.16 | 1.353 | 1.25 |
| 5.199335841690924 | 1.16 | 1.353 | 1.253 |
| 5.202477434344513 | 1.16 | 1.353 | 1.256 |
| 5.205619026998103 | 1.16 | 1.353 | 1.259 |
| 5.208760619651692 | 1.16 | 1.353 | 1.262 |
| 5.211902212305282 | 1.16 | 1.353 | 1.265 |
| 5.215043804958871 | 1.16 | 1.353 | 1.268 |
| 5.218185397612461 | 1.16 | 1.353 | 1.271 |
| 5.221326990266051 | 1.16 | 1.353 | 1.274 |
| 5.22446858291964 | 1.16 | 1.353 | 1.277 |
| 5.22761017557323 | 1.16 | 1.353 | 1.28 |
| 5.23075176822682 | 1.16 | 1.353 | 1.283 |
| 5.23389336088041 | 1.16 | 1.353 | 1.286 |
| 5.237034953533999 | 1.16 | 1.353 | 1.29 |
| 5.240176546187588 | 1.16 | 1.353 | 1.293 |
| 5.243318138841178 | 1.16 | 1.353 | 1.296 |
| 5.246459731494767 | 1.16 | 1.353 | 1.299 |
| 5.249601324148357 | 1.16 | 1.353 | 1.302 |
| 5.252742916801947 | 1.16 | 1.353 | 1.305 |
| 5.255884509455536 | 1.16 | 1.353 | 1.308 |
| 5.259026102109125 | 1.16 | 1.353 | 1.311 |
| 5.262167694762715 | 1.16 | 1.353 | 1.314 |
| 5.265309287416305 | 1.16 | 1.353 | 1.317 |
| 5.268450880069895 | 1.16 | 1.353 | 1.321 |
| 5.271592472723484 | 1.16 | 1.353 | 1.323 |
| 5.274734065377074 | 1.16 | 1.353 | 1.326 |
| 5.277875658030664 | 1.16 | 1.353 | 1.329 |
| 5.281017250684253 | 1.16 | 1.353 | 1.332 |
| 5.284158843337843 | 1.16 | 1.353 | 1.335 |
| 5.287300435991432 | 1.16 | 1.353 | 1.338 |
| 5.290442028645022 | 1.16 | 1.353 | 1.341 |
| 5.293583621298612 | 1.16 | 1.353 | 1.343 |
| 5.296725213952201 | 1.16 | 1.353 | 1.346 |
| 5.299866806605791 | 1.16 | 1.353 | 1.349 |
| 5.30300839925938 | 1.16 | 1.353 | 1.351 |
| 5.30614999191297 | 1.16 | 1.353 | 1.354 |
| 5.30929158456656 | 1.16 | 1.353 | 1.356 |
| 5.312433177220149 | 1.16 | 1.353 | 1.359 |
| 5.315574769873739 | 1.16 | 1.353 | 1.361 |
| 5.318716362527328 | 1.16 | 1.353 | 1.363 |
| 5.321857955180918 | 1.16 | 1.353 | 1.366 |
| 5.324999547834508 | 1.16 | 1.353 | 1.368 |
| 5.328141140488097 | 1.16 | 1.353 | 1.37 |
| 5.331282733141686 | 1.16 | 1.353 | 1.372 |
| 5.334424325795276 | 1.16 | 1.353 | 1.374 |
| 5.337565918448866 | 1.16 | 1.353 | 1.376 |
| 5.340707511102456 | 1.16 | 1.353 | 1.378 |
| 5.343849103756045 | 1.16 | 1.353 | 1.38 |
| 5.346990696409634 | 1.16 | 1.353 | 1.382 |
| 5.350132289063224 | 1.16 | 1.353 | 1.384 |
| 5.353273881716814 | 1.16 | 1.353 | 1.385 |
| 5.356415474370403 | 1.16 | 1.353 | 1.387 |
| 5.359557067023993 | 1.16 | 1.353 | 1.389 |
| 5.362698659677583 | 1.16 | 1.353 | 1.39 |
| 5.365840252331172 | 1.16 | 1.353 | 1.392 |
| 5.368981844984762 | 1.16 | 1.353 | 1.393 |
| 5.372123437638351 | 1.16 | 1.353 | 1.394 |
| 5.375265030291941 | 1.16 | 1.353 | 1.396 |
| 5.378406622945531 | 1.16 | 1.353 | 1.397 |
| 5.38154821559912 | 1.16 | 1.353 | 1.398 |
| 5.38468980825271 | 1.16 | 1.353 | 1.399 |
| 5.387831400906299 | 1.16 | 1.353 | 1.4 |
| 5.39097299355989 | 1.16 | 1.353 | 1.401 |
| 5.394114586213479 | 1.16 | 1.353 | 1.402 |
| 5.397256178867068 | 1.16 | 1.353 | 1.403 |
| 5.400397771520657 | 1.16 | 1.353 | 1.404 |
| 5.403539364174247 | 1.16 | 1.353 | 1.405 |
| 5.406680956827837 | 1.161 | 1.353 | 1.406 |
| 5.409822549481426 | 1.161 | 1.353 | 1.407 |
| 5.412964142135016 | 1.161 | 1.353 | 1.407 |
| 5.416105734788605 | 1.161 | 1.353 | 1.408 |
| 5.419247327442195 | 1.161 | 1.353 | 1.409 |
| 5.422388920095785 | 1.161 | 1.353 | 1.409 |
| 5.425530512749375 | 1.161 | 1.353 | 1.41 |
| 5.428672105402964 | 1.161 | 1.353 | 1.411 |
| 5.431813698056554 | 1.161 | 1.353 | 1.411 |
| 5.434955290710143 | 1.161 | 1.353 | 1.412 |
| 5.438096883363733 | 1.161 | 1.353 | 1.412 |
| 5.441238476017322 | 1.161 | 1.353 | 1.412 |
| 5.444380068670912 | 1.161 | 1.353 | 1.413 |
| 5.447521661324502 | 1.161 | 1.353 | 1.413 |
| 5.450663253978091 | 1.161 | 1.353 | 1.414 |
| 5.453804846631681 | 1.161 | 1.353 | 1.414 |
| 5.456946439285271 | 1.161 | 1.353 | 1.414 |
| 5.46008803193886 | 1.161 | 1.353 | 1.414 |
| 5.46322962459245 | 1.161 | 1.353 | 1.415 |
| 5.466371217246039 | 1.162 | 1.353 | 1.415 |
| 5.46951280989963 | 1.162 | 1.353 | 1.415 |
| 5.472654402553218 | 1.162 | 1.353 | 1.415 |
| 5.475795995206808 | 1.162 | 1.353 | 1.416 |
| 5.478937587860398 | 1.162 | 1.353 | 1.416 |
| 5.482079180513987 | 1.162 | 1.353 | 1.416 |
| 5.485220773167577 | 1.162 | 1.353 | 1.416 |
| 5.488362365821166 | 1.162 | 1.353 | 1.416 |
| 5.491503958474756 | 1.162 | 1.353 | 1.416 |
| 5.494645551128346 | 1.162 | 1.353 | 1.416 |
| 5.497787143781935 | 1.162 | 1.353 | 1.417 |
| 5.500928736435525 | 1.162 | 1.353 | 1.417 |
| 5.504070329089115 | 1.163 | 1.353 | 1.417 |
| 5.507211921742704 | 1.163 | 1.353 | 1.417 |
| 5.510353514396294 | 1.163 | 1.353 | 1.417 |
| 5.513495107049883 | 1.163 | 1.353 | 1.417 |
| 5.516636699703473 | 1.163 | 1.353 | 1.417 |
| 5.519778292357062 | 1.163 | 1.353 | 1.417 |
| 5.522919885010652 | 1.163 | 1.353 | 1.417 |
| 5.526061477664242 | 1.163 | 1.353 | 1.417 |
| 5.529203070317831 | 1.163 | 1.353 | 1.417 |
| 5.532344662971421 | 1.164 | 1.353 | 1.417 |
| 5.535486255625011 | 1.164 | 1.353 | 1.417 |
| 5.5386278482786 | 1.164 | 1.353 | 1.417 |
| 5.54176944093219 | 1.164 | 1.353 | 1.417 |
| 5.544911033585779 | 1.164 | 1.353 | 1.417 |
| 5.54805262623937 | 1.164 | 1.353 | 1.417 |
| 5.551194218892959 | 1.165 | 1.353 | 1.417 |
| 5.554335811546548 | 1.165 | 1.353 | 1.417 |
| 5.557477404200137 | 1.165 | 1.353 | 1.417 |
| 5.560618996853727 | 1.165 | 1.353 | 1.417 |
| 5.563760589507317 | 1.165 | 1.353 | 1.417 |
| 5.566902182160906 | 1.165 | 1.353 | 1.417 |
| 5.570043774814496 | 1.166 | 1.353 | 1.417 |
| 5.573185367468086 | 1.166 | 1.353 | 1.417 |
| 5.576326960121675 | 1.166 | 1.353 | 1.417 |
| 5.579468552775264 | 1.166 | 1.353 | 1.417 |
| 5.582610145428854 | 1.166 | 1.353 | 1.417 |
| 5.585751738082444 | 1.167 | 1.353 | 1.417 |
| 5.588893330736034 | 1.167 | 1.353 | 1.417 |
| 5.592034923389623 | 1.167 | 1.353 | 1.417 |
| 5.595176516043213 | 1.167 | 1.353 | 1.417 |
| 5.598318108696803 | 1.168 | 1.353 | 1.417 |
| 5.601459701350392 | 1.168 | 1.353 | 1.417 |
| 5.604601294003982 | 1.168 | 1.353 | 1.417 |
| 5.607742886657571 | 1.168 | 1.353 | 1.417 |
| 5.610884479311161 | 1.169 | 1.353 | 1.417 |
| 5.61402607196475 | 1.169 | 1.353 | 1.417 |
| 5.61716766461834 | 1.169 | 1.353 | 1.417 |
| 5.62030925727193 | 1.169 | 1.353 | 1.417 |
| 5.623450849925519 | 1.17 | 1.353 | 1.417 |
| 5.626592442579109 | 1.17 | 1.353 | 1.417 |
| 5.629734035232698 | 1.17 | 1.353 | 1.417 |
| 5.632875627886288 | 1.171 | 1.353 | 1.417 |
| 5.636017220539878 | 1.171 | 1.353 | 1.417 |
| 5.639158813193467 | 1.171 | 1.353 | 1.417 |
| 5.642300405847057 | 1.172 | 1.353 | 1.417 |
| 5.645441998500646 | 1.172 | 1.353 | 1.417 |
| 5.648583591154236 | 1.172 | 1.353 | 1.417 |
| 5.651725183807825 | 1.173 | 1.353 | 1.417 |
| 5.654866776461415 | 1.173 | 1.353 | 1.417 |
| 5.658008369115005 | 1.173 | 1.353 | 1.417 |
| 5.661149961768594 | 1.174 | 1.353 | 1.417 |
| 5.664291554422184 | 1.174 | 1.353 | 1.417 |
| 5.667433147075774 | 1.175 | 1.353 | 1.417 |
| 5.670574739729363 | 1.175 | 1.353 | 1.417 |
| 5.673716332382953 | 1.176 | 1.353 | 1.417 |
| 5.676857925036542 | 1.176 | 1.353 | 1.417 |
| 5.679999517690132 | 1.176 | 1.353 | 1.417 |
| 5.683141110343721 | 1.177 | 1.353 | 1.417 |
| 5.686282702997311 | 1.177 | 1.353 | 1.417 |
| 5.689424295650901 | 1.178 | 1.353 | 1.417 |
| 5.69256588830449 | 1.178 | 1.353 | 1.417 |
| 5.69570748095808 | 1.179 | 1.353 | 1.417 |
| 5.69884907361167 | 1.179 | 1.353 | 1.417 |
| 5.701990666265259 | 1.18 | 1.353 | 1.417 |
| 5.705132258918849 | 1.18 | 1.353 | 1.417 |
| 5.708273851572438 | 1.181 | 1.353 | 1.417 |
| 5.711415444226028 | 1.181 | 1.353 | 1.417 |
| 5.714557036879618 | 1.182 | 1.353 | 1.417 |
| 5.717698629533207 | 1.183 | 1.353 | 1.417 |
| 5.720840222186797 | 1.183 | 1.353 | 1.417 |
| 5.723981814840386 | 1.184 | 1.353 | 1.417 |
| 5.727123407493976 | 1.184 | 1.353 | 1.417 |
| 5.730265000147565 | 1.185 | 1.353 | 1.417 |
| 5.733406592801155 | 1.186 | 1.353 | 1.417 |
| 5.736548185454744 | 1.186 | 1.353 | 1.417 |
| 5.739689778108334 | 1.187 | 1.353 | 1.417 |
| 5.742831370761924 | 1.188 | 1.353 | 1.417 |
| 5.745972963415514 | 1.188 | 1.353 | 1.417 |
| 5.749114556069103 | 1.189 | 1.353 | 1.417 |
| 5.752256148722693 | 1.19 | 1.353 | 1.417 |
| 5.755397741376282 | 1.19 | 1.353 | 1.417 |
| 5.758539334029872 | 1.191 | 1.353 | 1.417 |
| 5.761680926683462 | 1.192 | 1.353 | 1.417 |
| 5.764822519337051 | 1.193 | 1.353 | 1.417 |
| 5.767964111990641 | 1.193 | 1.353 | 1.417 |
| 5.77110570464423 | 1.194 | 1.353 | 1.417 |
| 5.77424729729782 | 1.195 | 1.353 | 1.417 |
| 5.77738888995141 | 1.196 | 1.353 | 1.417 |
| 5.780530482605 | 1.197 | 1.353 | 1.417 |
| 5.783672075258588 | 1.197 | 1.353 | 1.417 |
| 5.786813667912178 | 1.198 | 1.353 | 1.417 |
| 5.789955260565768 | 1.199 | 1.353 | 1.417 |
| 5.793096853219358 | 1.2 | 1.353 | 1.417 |
| 5.796238445872947 | 1.201 | 1.353 | 1.417 |
| 5.799380038526537 | 1.202 | 1.353 | 1.417 |
| 5.802521631180126 | 1.203 | 1.353 | 1.417 |
| 5.805663223833715 | 1.204 | 1.353 | 1.417 |
| 5.808804816487306 | 1.205 | 1.353 | 1.417 |
| 5.811946409140895 | 1.206 | 1.353 | 1.417 |
| 5.815088001794485 | 1.207 | 1.353 | 1.417 |
| 5.818229594448074 | 1.208 | 1.353 | 1.417 |
| 5.821371187101663 | 1.209 | 1.353 | 1.417 |
| 5.824512779755254 | 1.21 | 1.353 | 1.417 |
| 5.827654372408843 | 1.211 | 1.353 | 1.417 |
| 5.830795965062433 | 1.212 | 1.353 | 1.417 |
| 5.833937557716022 | 1.213 | 1.353 | 1.417 |
| 5.837079150369612 | 1.214 | 1.353 | 1.417 |
| 5.840220743023201 | 1.215 | 1.353 | 1.417 |
| 5.843362335676791 | 1.216 | 1.353 | 1.417 |
| 5.846503928330381 | 1.218 | 1.353 | 1.417 |
| 5.84964552098397 | 1.219 | 1.353 | 1.417 |
| 5.85278711363756 | 1.22 | 1.353 | 1.417 |
| 5.85592870629115 | 1.221 | 1.354 | 1.417 |
| 5.85907029894474 | 1.222 | 1.354 | 1.417 |
| 5.862211891598329 | 1.224 | 1.354 | 1.417 |
| 5.865353484251918 | 1.225 | 1.354 | 1.417 |
| 5.868495076905508 | 1.226 | 1.354 | 1.417 |
| 5.871636669559098 | 1.228 | 1.354 | 1.417 |
| 5.874778262212687 | 1.229 | 1.354 | 1.417 |
| 5.877919854866277 | 1.23 | 1.354 | 1.417 |
| 5.881061447519866 | 1.232 | 1.354 | 1.417 |
| 5.884203040173456 | 1.233 | 1.354 | 1.417 |
| 5.887344632827046 | 1.234 | 1.354 | 1.417 |
| 5.890486225480635 | 1.236 | 1.354 | 1.417 |
| 5.893627818134224 | 1.237 | 1.354 | 1.417 |
| 5.896769410787814 | 1.239 | 1.355 | 1.417 |
| 5.899911003441404 | 1.24 | 1.355 | 1.417 |
| 5.903052596094994 | 1.242 | 1.355 | 1.417 |
| 5.906194188748583 | 1.243 | 1.355 | 1.417 |
| 5.909335781402172 | 1.245 | 1.355 | 1.417 |
| 5.912477374055762 | 1.246 | 1.355 | 1.417 |
| 5.915618966709352 | 1.248 | 1.355 | 1.417 |
| 5.918760559362942 | 1.249 | 1.355 | 1.417 |
| 5.921902152016531 | 1.251 | 1.356 | 1.417 |
| 5.92504374467012 | 1.253 | 1.356 | 1.417 |
| 5.92818533732371 | 1.254 | 1.356 | 1.417 |
| 5.9313269299773 | 1.256 | 1.356 | 1.417 |
| 5.93446852263089 | 1.258 | 1.356 | 1.417 |
| 5.93761011528448 | 1.259 | 1.357 | 1.417 |
| 5.940751707938068 | 1.261 | 1.357 | 1.417 |
| 5.943893300591658 | 1.263 | 1.357 | 1.417 |
| 5.947034893245248 | 1.264 | 1.357 | 1.417 |
| 5.950176485898837 | 1.266 | 1.358 | 1.417 |
| 5.953318078552427 | 1.268 | 1.358 | 1.417 |
| 5.956459671206017 | 1.27 | 1.358 | 1.417 |
| 5.959601263859606 | 1.272 | 1.359 | 1.417 |
| 5.962742856513196 | 1.274 | 1.359 | 1.417 |
| 5.965884449166785 | 1.275 | 1.359 | 1.417 |
| 5.969026041820375 | 1.277 | 1.36 | 1.418 |
| 5.972167634473964 | 1.279 | 1.36 | 1.418 |
| 5.975309227127554 | 1.281 | 1.36 | 1.418 |
| 5.978450819781144 | 1.283 | 1.361 | 1.418 |
| 5.981592412434733 | 1.285 | 1.361 | 1.418 |
| 5.984734005088323 | 1.287 | 1.362 | 1.418 |
| 5.987875597741913 | 1.289 | 1.362 | 1.418 |
| 5.991017190395502 | 1.291 | 1.363 | 1.418 |
| 5.994158783049092 | 1.293 | 1.363 | 1.418 |
| 5.997300375702681 | 1.295 | 1.364 | 1.418 |
| 6.000441968356271 | 1.297 | 1.364 | 1.418 |
| 6.003583561009861 | 1.299 | 1.365 | 1.418 |
| 6.00672515366345 | 1.302 | 1.366 | 1.418 |
| 6.00986674631704 | 1.304 | 1.366 | 1.418 |
| 6.01300833897063 | 1.306 | 1.367 | 1.418 |
| 6.01614993162422 | 1.308 | 1.368 | 1.418 |
| 6.019291524277808 | 1.31 | 1.368 | 1.418 |
| 6.022433116931398 | 1.312 | 1.369 | 1.418 |
| 6.025574709584988 | 1.315 | 1.37 | 1.418 |
| 6.028716302238577 | 1.317 | 1.371 | 1.419 |
| 6.031857894892167 | 1.319 | 1.371 | 1.419 |
| 6.034999487545757 | 1.321 | 1.372 | 1.419 |
| 6.038141080199346 | 1.324 | 1.373 | 1.419 |
| 6.041282672852935 | 1.326 | 1.374 | 1.419 |
| 6.044424265506525 | 1.328 | 1.375 | 1.419 |
| 6.047565858160115 | 1.331 | 1.376 | 1.419 |
| 6.050707450813704 | 1.333 | 1.377 | 1.42 |
| 6.053849043467294 | 1.336 | 1.378 | 1.42 |
| 6.056990636120884 | 1.338 | 1.379 | 1.42 |
| 6.060132228774473 | 1.34 | 1.38 | 1.42 |
| 6.063273821428063 | 1.343 | 1.381 | 1.421 |
| 6.066415414081653 | 1.345 | 1.383 | 1.421 |
| 6.069557006735242 | 1.348 | 1.384 | 1.421 |
| 6.072698599388831 | 1.35 | 1.385 | 1.422 |
| 6.07584019204242 | 1.353 | 1.386 | 1.422 |
| 6.078981784696011 | 1.355 | 1.388 | 1.423 |
| 6.082123377349601 | 1.358 | 1.389 | 1.423 |
| 6.08526497000319 | 1.361 | 1.39 | 1.423 |
| 6.08840656265678 | 1.363 | 1.392 | 1.424 |
| 6.09154815531037 | 1.366 | 1.393 | 1.424 |
| 6.094689747963959 | 1.368 | 1.395 | 1.425 |
| 6.097831340617549 | 1.371 | 1.396 | 1.426 |
| 6.100972933271138 | 1.374 | 1.398 | 1.426 |
| 6.104114525924728 | 1.376 | 1.399 | 1.427 |
| 6.107256118578317 | 1.379 | 1.401 | 1.428 |
| 6.110397711231907 | 1.382 | 1.403 | 1.428 |
| 6.113539303885497 | 1.384 | 1.404 | 1.429 |
| 6.116680896539086 | 1.387 | 1.406 | 1.43 |
| 6.119822489192675 | 1.39 | 1.408 | 1.431 |
| 6.122964081846265 | 1.393 | 1.41 | 1.432 |
| 6.126105674499855 | 1.395 | 1.412 | 1.433 |
| 6.129247267153445 | 1.398 | 1.414 | 1.434 |
| 6.132388859807034 | 1.401 | 1.416 | 1.435 |
| 6.135530452460624 | 1.404 | 1.418 | 1.436 |
| 6.138672045114213 | 1.407 | 1.42 | 1.437 |
| 6.141813637767803 | 1.409 | 1.422 | 1.438 |
| 6.144955230421393 | 1.412 | 1.424 | 1.44 |
| 6.148096823074982 | 1.415 | 1.426 | 1.441 |
| 6.151238415728571 | 1.418 | 1.428 | 1.442 |
| 6.154380008382161 | 1.421 | 1.43 | 1.444 |
| 6.157521601035751 | 1.424 | 1.433 | 1.445 |
| 6.16066319368934 | 1.427 | 1.435 | 1.447 |
| 6.16380478634293 | 1.43 | 1.437 | 1.448 |
| 6.16694637899652 | 1.433 | 1.44 | 1.45 |
| 6.170087971650109 | 1.436 | 1.442 | 1.452 |
| 6.173229564303698 | 1.438 | 1.445 | 1.454 |
| 6.176371156957289 | 1.441 | 1.447 | 1.455 |
| 6.179512749610878 | 1.444 | 1.45 | 1.457 |
| 6.182654342264468 | 1.447 | 1.452 | 1.459 |
| 6.185795934918057 | 1.45 | 1.455 | 1.461 |
| 6.188937527571647 | 1.453 | 1.457 | 1.463 |
| 6.192079120225237 | 1.456 | 1.46 | 1.465 |
| 6.195220712878826 | 1.459 | 1.463 | 1.468 |
| 6.198362305532415 | 1.462 | 1.465 | 1.47 |
| 6.201503898186005 | 1.465 | 1.468 | 1.472 |
| 6.204645490839594 | 1.469 | 1.471 | 1.474 |
| 6.207787083493184 | 1.472 | 1.474 | 1.477 |
| 6.210928676146774 | 1.475 | 1.476 | 1.479 |
| 6.214070268800364 | 1.478 | 1.479 | 1.482 |
| 6.217211861453953 | 1.481 | 1.482 | 1.484 |
| 6.220353454107543 | 1.484 | 1.485 | 1.487 |
| 6.223495046761133 | 1.487 | 1.488 | 1.49 |
| 6.226636639414722 | 1.49 | 1.491 | 1.492 |
| 6.229778232068312 | 1.493 | 1.494 | 1.495 |
| 6.232919824721901 | 1.496 | 1.497 | 1.498 |
| 6.236061417375491 | 1.499 | 1.5 | 1.501 |
| 6.23920301002908 | 1.502 | 1.503 | 1.504 |
| 6.24234460268267 | 1.506 | 1.506 | 1.506 |
| 6.24548619533626 | 1.509 | 1.509 | 1.509 |
| 6.24862778798985 | 1.512 | 1.512 | 1.512 |
| 6.251769380643438 | 1.515 | 1.515 | 1.515 |
| 6.254910973297028 | 1.518 | 1.518 | 1.518 |
| 6.258052565950618 | 1.521 | 1.521 | 1.521 |
| 6.261194158604208 | 1.524 | 1.524 | 1.524 |
| 6.264335751257797 | 1.527 | 1.527 | 1.528 |
| 6.267477343911387 | 1.531 | 1.531 | 1.531 |
| 6.270618936564976 | 1.534 | 1.534 | 1.534 |
| 6.273760529218566 | 1.537 | 1.537 | 1.537 |
| 6.276902121872155 | 1.54 | 1.54 | 1.54 |
| 6.280043714525745 | 1.543 | 1.543 | 1.543 |
| 6.283185307179335 | 1.546 | 1.546 | 1.546 |